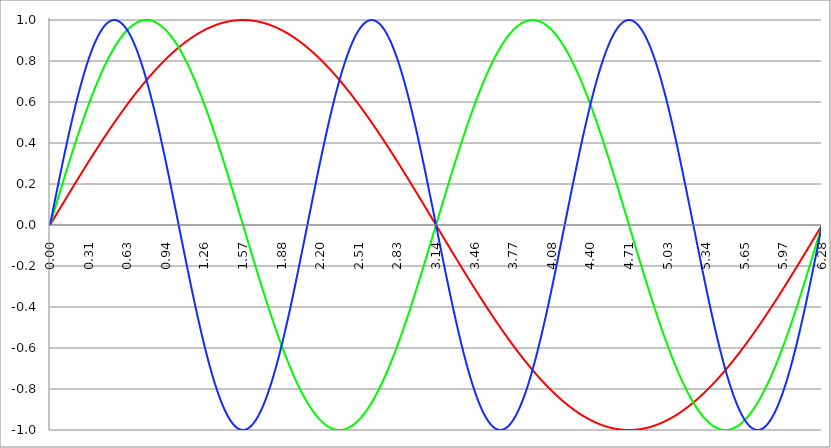
| Category | Series 1 | Series 0 | Series 2 |
|---|---|---|---|
| 0.0 | 0 | 0 | 0 |
| 0.00314159265358979 | 0.003 | 0.006 | 0.009 |
| 0.00628318530717958 | 0.006 | 0.013 | 0.019 |
| 0.00942477796076938 | 0.009 | 0.019 | 0.028 |
| 0.0125663706143592 | 0.013 | 0.025 | 0.038 |
| 0.015707963267949 | 0.016 | 0.031 | 0.047 |
| 0.0188495559215388 | 0.019 | 0.038 | 0.057 |
| 0.0219911485751285 | 0.022 | 0.044 | 0.066 |
| 0.0251327412287183 | 0.025 | 0.05 | 0.075 |
| 0.0282743338823081 | 0.028 | 0.057 | 0.085 |
| 0.0314159265358979 | 0.031 | 0.063 | 0.094 |
| 0.0345575191894877 | 0.035 | 0.069 | 0.103 |
| 0.0376991118430775 | 0.038 | 0.075 | 0.113 |
| 0.0408407044966673 | 0.041 | 0.082 | 0.122 |
| 0.0439822971502571 | 0.044 | 0.088 | 0.132 |
| 0.0471238898038469 | 0.047 | 0.094 | 0.141 |
| 0.0502654824574367 | 0.05 | 0.1 | 0.15 |
| 0.0534070751110265 | 0.053 | 0.107 | 0.16 |
| 0.0565486677646163 | 0.057 | 0.113 | 0.169 |
| 0.059690260418206 | 0.06 | 0.119 | 0.178 |
| 0.0628318530717958 | 0.063 | 0.125 | 0.187 |
| 0.0659734457253856 | 0.066 | 0.132 | 0.197 |
| 0.0691150383789754 | 0.069 | 0.138 | 0.206 |
| 0.0722566310325652 | 0.072 | 0.144 | 0.215 |
| 0.075398223686155 | 0.075 | 0.15 | 0.224 |
| 0.0785398163397448 | 0.078 | 0.156 | 0.233 |
| 0.0816814089933346 | 0.082 | 0.163 | 0.243 |
| 0.0848230016469244 | 0.085 | 0.169 | 0.252 |
| 0.0879645943005142 | 0.088 | 0.175 | 0.261 |
| 0.091106186954104 | 0.091 | 0.181 | 0.27 |
| 0.0942477796076937 | 0.094 | 0.187 | 0.279 |
| 0.0973893722612835 | 0.097 | 0.194 | 0.288 |
| 0.100530964914873 | 0.1 | 0.2 | 0.297 |
| 0.103672557568463 | 0.103 | 0.206 | 0.306 |
| 0.106814150222053 | 0.107 | 0.212 | 0.315 |
| 0.109955742875643 | 0.11 | 0.218 | 0.324 |
| 0.113097335529233 | 0.113 | 0.224 | 0.333 |
| 0.116238928182822 | 0.116 | 0.23 | 0.342 |
| 0.119380520836412 | 0.119 | 0.236 | 0.351 |
| 0.122522113490002 | 0.122 | 0.243 | 0.359 |
| 0.125663706143592 | 0.125 | 0.249 | 0.368 |
| 0.128805298797181 | 0.128 | 0.255 | 0.377 |
| 0.131946891450771 | 0.132 | 0.261 | 0.386 |
| 0.135088484104361 | 0.135 | 0.267 | 0.394 |
| 0.138230076757951 | 0.138 | 0.273 | 0.403 |
| 0.141371669411541 | 0.141 | 0.279 | 0.412 |
| 0.14451326206513 | 0.144 | 0.285 | 0.42 |
| 0.14765485471872 | 0.147 | 0.291 | 0.429 |
| 0.15079644737231 | 0.15 | 0.297 | 0.437 |
| 0.1539380400259 | 0.153 | 0.303 | 0.446 |
| 0.15707963267949 | 0.156 | 0.309 | 0.454 |
| 0.160221225333079 | 0.16 | 0.315 | 0.462 |
| 0.163362817986669 | 0.163 | 0.321 | 0.471 |
| 0.166504410640259 | 0.166 | 0.327 | 0.479 |
| 0.169646003293849 | 0.169 | 0.333 | 0.487 |
| 0.172787595947439 | 0.172 | 0.339 | 0.495 |
| 0.175929188601028 | 0.175 | 0.345 | 0.504 |
| 0.179070781254618 | 0.178 | 0.351 | 0.512 |
| 0.182212373908208 | 0.181 | 0.356 | 0.52 |
| 0.185353966561798 | 0.184 | 0.362 | 0.528 |
| 0.188495559215388 | 0.187 | 0.368 | 0.536 |
| 0.191637151868977 | 0.19 | 0.374 | 0.544 |
| 0.194778744522567 | 0.194 | 0.38 | 0.552 |
| 0.197920337176157 | 0.197 | 0.386 | 0.559 |
| 0.201061929829747 | 0.2 | 0.391 | 0.567 |
| 0.204203522483336 | 0.203 | 0.397 | 0.575 |
| 0.207345115136926 | 0.206 | 0.403 | 0.583 |
| 0.210486707790516 | 0.209 | 0.409 | 0.59 |
| 0.213628300444106 | 0.212 | 0.414 | 0.598 |
| 0.216769893097696 | 0.215 | 0.42 | 0.605 |
| 0.219911485751285 | 0.218 | 0.426 | 0.613 |
| 0.223053078404875 | 0.221 | 0.431 | 0.62 |
| 0.226194671058465 | 0.224 | 0.437 | 0.628 |
| 0.229336263712055 | 0.227 | 0.443 | 0.635 |
| 0.232477856365645 | 0.23 | 0.448 | 0.642 |
| 0.235619449019234 | 0.233 | 0.454 | 0.649 |
| 0.238761041672824 | 0.236 | 0.46 | 0.657 |
| 0.241902634326414 | 0.24 | 0.465 | 0.664 |
| 0.245044226980004 | 0.243 | 0.471 | 0.671 |
| 0.248185819633594 | 0.246 | 0.476 | 0.678 |
| 0.251327412287183 | 0.249 | 0.482 | 0.685 |
| 0.254469004940773 | 0.252 | 0.487 | 0.691 |
| 0.257610597594363 | 0.255 | 0.493 | 0.698 |
| 0.260752190247953 | 0.258 | 0.498 | 0.705 |
| 0.263893782901543 | 0.261 | 0.504 | 0.712 |
| 0.267035375555132 | 0.264 | 0.509 | 0.718 |
| 0.270176968208722 | 0.267 | 0.514 | 0.725 |
| 0.273318560862312 | 0.27 | 0.52 | 0.731 |
| 0.276460153515902 | 0.273 | 0.525 | 0.738 |
| 0.279601746169492 | 0.276 | 0.531 | 0.744 |
| 0.282743338823082 | 0.279 | 0.536 | 0.75 |
| 0.285884931476671 | 0.282 | 0.541 | 0.756 |
| 0.289026524130261 | 0.285 | 0.546 | 0.762 |
| 0.292168116783851 | 0.288 | 0.552 | 0.769 |
| 0.295309709437441 | 0.291 | 0.557 | 0.775 |
| 0.298451302091031 | 0.294 | 0.562 | 0.78 |
| 0.30159289474462 | 0.297 | 0.567 | 0.786 |
| 0.30473448739821 | 0.3 | 0.572 | 0.792 |
| 0.3078760800518 | 0.303 | 0.578 | 0.798 |
| 0.31101767270539 | 0.306 | 0.583 | 0.803 |
| 0.31415926535898 | 0.309 | 0.588 | 0.809 |
| 0.31730085801257 | 0.312 | 0.593 | 0.815 |
| 0.320442450666159 | 0.315 | 0.598 | 0.82 |
| 0.323584043319749 | 0.318 | 0.603 | 0.825 |
| 0.326725635973339 | 0.321 | 0.608 | 0.831 |
| 0.329867228626929 | 0.324 | 0.613 | 0.836 |
| 0.333008821280519 | 0.327 | 0.618 | 0.841 |
| 0.336150413934108 | 0.33 | 0.623 | 0.846 |
| 0.339292006587698 | 0.333 | 0.628 | 0.851 |
| 0.342433599241288 | 0.336 | 0.633 | 0.856 |
| 0.345575191894878 | 0.339 | 0.637 | 0.861 |
| 0.348716784548468 | 0.342 | 0.642 | 0.866 |
| 0.351858377202058 | 0.345 | 0.647 | 0.87 |
| 0.354999969855647 | 0.348 | 0.652 | 0.875 |
| 0.358141562509237 | 0.351 | 0.657 | 0.879 |
| 0.361283155162827 | 0.353 | 0.661 | 0.884 |
| 0.364424747816417 | 0.356 | 0.666 | 0.888 |
| 0.367566340470007 | 0.359 | 0.671 | 0.892 |
| 0.370707933123597 | 0.362 | 0.675 | 0.897 |
| 0.373849525777186 | 0.365 | 0.68 | 0.901 |
| 0.376991118430776 | 0.368 | 0.685 | 0.905 |
| 0.380132711084366 | 0.371 | 0.689 | 0.909 |
| 0.383274303737956 | 0.374 | 0.694 | 0.913 |
| 0.386415896391546 | 0.377 | 0.698 | 0.917 |
| 0.389557489045135 | 0.38 | 0.703 | 0.92 |
| 0.392699081698725 | 0.383 | 0.707 | 0.924 |
| 0.395840674352315 | 0.386 | 0.712 | 0.927 |
| 0.398982267005905 | 0.388 | 0.716 | 0.931 |
| 0.402123859659495 | 0.391 | 0.72 | 0.934 |
| 0.405265452313085 | 0.394 | 0.725 | 0.938 |
| 0.408407044966674 | 0.397 | 0.729 | 0.941 |
| 0.411548637620264 | 0.4 | 0.733 | 0.944 |
| 0.414690230273854 | 0.403 | 0.738 | 0.947 |
| 0.417831822927444 | 0.406 | 0.742 | 0.95 |
| 0.420973415581034 | 0.409 | 0.746 | 0.953 |
| 0.424115008234623 | 0.412 | 0.75 | 0.956 |
| 0.427256600888213 | 0.414 | 0.754 | 0.959 |
| 0.430398193541803 | 0.417 | 0.758 | 0.961 |
| 0.433539786195393 | 0.42 | 0.762 | 0.964 |
| 0.436681378848983 | 0.423 | 0.766 | 0.966 |
| 0.439822971502573 | 0.426 | 0.771 | 0.969 |
| 0.442964564156162 | 0.429 | 0.775 | 0.971 |
| 0.446106156809752 | 0.431 | 0.778 | 0.973 |
| 0.449247749463342 | 0.434 | 0.782 | 0.975 |
| 0.452389342116932 | 0.437 | 0.786 | 0.977 |
| 0.455530934770522 | 0.44 | 0.79 | 0.979 |
| 0.458672527424111 | 0.443 | 0.794 | 0.981 |
| 0.461814120077701 | 0.446 | 0.798 | 0.983 |
| 0.464955712731291 | 0.448 | 0.802 | 0.985 |
| 0.468097305384881 | 0.451 | 0.805 | 0.986 |
| 0.471238898038471 | 0.454 | 0.809 | 0.988 |
| 0.474380490692061 | 0.457 | 0.813 | 0.989 |
| 0.47752208334565 | 0.46 | 0.816 | 0.99 |
| 0.48066367599924 | 0.462 | 0.82 | 0.992 |
| 0.48380526865283 | 0.465 | 0.824 | 0.993 |
| 0.48694686130642 | 0.468 | 0.827 | 0.994 |
| 0.49008845396001 | 0.471 | 0.831 | 0.995 |
| 0.493230046613599 | 0.473 | 0.834 | 0.996 |
| 0.496371639267189 | 0.476 | 0.838 | 0.997 |
| 0.499513231920779 | 0.479 | 0.841 | 0.997 |
| 0.502654824574369 | 0.482 | 0.844 | 0.998 |
| 0.505796417227959 | 0.485 | 0.848 | 0.999 |
| 0.508938009881549 | 0.487 | 0.851 | 0.999 |
| 0.512079602535138 | 0.49 | 0.854 | 0.999 |
| 0.515221195188728 | 0.493 | 0.858 | 1 |
| 0.518362787842318 | 0.495 | 0.861 | 1 |
| 0.521504380495908 | 0.498 | 0.864 | 1 |
| 0.524645973149498 | 0.501 | 0.867 | 1 |
| 0.527787565803087 | 0.504 | 0.87 | 1 |
| 0.530929158456677 | 0.506 | 0.873 | 1 |
| 0.534070751110267 | 0.509 | 0.876 | 1 |
| 0.537212343763857 | 0.512 | 0.879 | 0.999 |
| 0.540353936417447 | 0.514 | 0.882 | 0.999 |
| 0.543495529071037 | 0.517 | 0.885 | 0.998 |
| 0.546637121724626 | 0.52 | 0.888 | 0.998 |
| 0.549778714378216 | 0.522 | 0.891 | 0.997 |
| 0.552920307031806 | 0.525 | 0.894 | 0.996 |
| 0.556061899685396 | 0.528 | 0.897 | 0.995 |
| 0.559203492338986 | 0.531 | 0.899 | 0.994 |
| 0.562345084992576 | 0.533 | 0.902 | 0.993 |
| 0.565486677646165 | 0.536 | 0.905 | 0.992 |
| 0.568628270299755 | 0.538 | 0.907 | 0.991 |
| 0.571769862953345 | 0.541 | 0.91 | 0.99 |
| 0.574911455606935 | 0.544 | 0.913 | 0.988 |
| 0.578053048260525 | 0.546 | 0.915 | 0.987 |
| 0.581194640914114 | 0.549 | 0.918 | 0.985 |
| 0.584336233567704 | 0.552 | 0.92 | 0.983 |
| 0.587477826221294 | 0.554 | 0.923 | 0.982 |
| 0.590619418874884 | 0.557 | 0.925 | 0.98 |
| 0.593761011528474 | 0.559 | 0.927 | 0.978 |
| 0.596902604182064 | 0.562 | 0.93 | 0.976 |
| 0.600044196835653 | 0.565 | 0.932 | 0.974 |
| 0.603185789489243 | 0.567 | 0.934 | 0.972 |
| 0.606327382142833 | 0.57 | 0.937 | 0.969 |
| 0.609468974796423 | 0.572 | 0.939 | 0.967 |
| 0.612610567450013 | 0.575 | 0.941 | 0.965 |
| 0.615752160103602 | 0.578 | 0.943 | 0.962 |
| 0.618893752757192 | 0.58 | 0.945 | 0.959 |
| 0.622035345410782 | 0.583 | 0.947 | 0.957 |
| 0.625176938064372 | 0.585 | 0.949 | 0.954 |
| 0.628318530717962 | 0.588 | 0.951 | 0.951 |
| 0.631460123371551 | 0.59 | 0.953 | 0.948 |
| 0.634601716025141 | 0.593 | 0.955 | 0.945 |
| 0.637743308678731 | 0.595 | 0.957 | 0.942 |
| 0.640884901332321 | 0.598 | 0.959 | 0.939 |
| 0.644026493985911 | 0.6 | 0.96 | 0.935 |
| 0.647168086639501 | 0.603 | 0.962 | 0.932 |
| 0.65030967929309 | 0.605 | 0.964 | 0.929 |
| 0.65345127194668 | 0.608 | 0.965 | 0.925 |
| 0.65659286460027 | 0.61 | 0.967 | 0.921 |
| 0.65973445725386 | 0.613 | 0.969 | 0.918 |
| 0.66287604990745 | 0.615 | 0.97 | 0.914 |
| 0.666017642561039 | 0.618 | 0.972 | 0.91 |
| 0.669159235214629 | 0.62 | 0.973 | 0.906 |
| 0.672300827868219 | 0.623 | 0.975 | 0.902 |
| 0.675442420521809 | 0.625 | 0.976 | 0.898 |
| 0.678584013175399 | 0.628 | 0.977 | 0.894 |
| 0.681725605828989 | 0.63 | 0.979 | 0.89 |
| 0.684867198482578 | 0.633 | 0.98 | 0.885 |
| 0.688008791136168 | 0.635 | 0.981 | 0.881 |
| 0.691150383789758 | 0.637 | 0.982 | 0.876 |
| 0.694291976443348 | 0.64 | 0.983 | 0.872 |
| 0.697433569096938 | 0.642 | 0.985 | 0.867 |
| 0.700575161750528 | 0.645 | 0.986 | 0.862 |
| 0.703716754404117 | 0.647 | 0.987 | 0.858 |
| 0.706858347057707 | 0.649 | 0.988 | 0.853 |
| 0.709999939711297 | 0.652 | 0.989 | 0.848 |
| 0.713141532364887 | 0.654 | 0.99 | 0.843 |
| 0.716283125018477 | 0.657 | 0.99 | 0.838 |
| 0.719424717672066 | 0.659 | 0.991 | 0.832 |
| 0.722566310325656 | 0.661 | 0.992 | 0.827 |
| 0.725707902979246 | 0.664 | 0.993 | 0.822 |
| 0.728849495632836 | 0.666 | 0.994 | 0.816 |
| 0.731991088286426 | 0.668 | 0.994 | 0.811 |
| 0.735132680940016 | 0.671 | 0.995 | 0.805 |
| 0.738274273593605 | 0.673 | 0.996 | 0.8 |
| 0.741415866247195 | 0.675 | 0.996 | 0.794 |
| 0.744557458900785 | 0.678 | 0.997 | 0.788 |
| 0.747699051554375 | 0.68 | 0.997 | 0.782 |
| 0.750840644207965 | 0.682 | 0.998 | 0.776 |
| 0.753982236861554 | 0.685 | 0.998 | 0.771 |
| 0.757123829515144 | 0.687 | 0.998 | 0.764 |
| 0.760265422168734 | 0.689 | 0.999 | 0.758 |
| 0.763407014822324 | 0.691 | 0.999 | 0.752 |
| 0.766548607475914 | 0.694 | 0.999 | 0.746 |
| 0.769690200129504 | 0.696 | 1 | 0.74 |
| 0.772831792783093 | 0.698 | 1 | 0.733 |
| 0.775973385436683 | 0.7 | 1 | 0.727 |
| 0.779114978090273 | 0.703 | 1 | 0.72 |
| 0.782256570743863 | 0.705 | 1 | 0.714 |
| 0.785398163397453 | 0.707 | 1 | 0.707 |
| 0.788539756051042 | 0.709 | 1 | 0.7 |
| 0.791681348704632 | 0.712 | 1 | 0.694 |
| 0.794822941358222 | 0.714 | 1 | 0.687 |
| 0.797964534011812 | 0.716 | 1 | 0.68 |
| 0.801106126665402 | 0.718 | 1 | 0.673 |
| 0.804247719318992 | 0.72 | 0.999 | 0.666 |
| 0.807389311972581 | 0.722 | 0.999 | 0.659 |
| 0.810530904626171 | 0.725 | 0.999 | 0.652 |
| 0.813672497279761 | 0.727 | 0.998 | 0.645 |
| 0.816814089933351 | 0.729 | 0.998 | 0.637 |
| 0.819955682586941 | 0.731 | 0.998 | 0.63 |
| 0.823097275240531 | 0.733 | 0.997 | 0.623 |
| 0.82623886789412 | 0.735 | 0.997 | 0.615 |
| 0.82938046054771 | 0.738 | 0.996 | 0.608 |
| 0.8325220532013 | 0.74 | 0.996 | 0.6 |
| 0.83566364585489 | 0.742 | 0.995 | 0.593 |
| 0.83880523850848 | 0.744 | 0.994 | 0.585 |
| 0.841946831162069 | 0.746 | 0.994 | 0.578 |
| 0.845088423815659 | 0.748 | 0.993 | 0.57 |
| 0.848230016469249 | 0.75 | 0.992 | 0.562 |
| 0.851371609122839 | 0.752 | 0.991 | 0.554 |
| 0.854513201776429 | 0.754 | 0.99 | 0.546 |
| 0.857654794430019 | 0.756 | 0.99 | 0.538 |
| 0.860796387083608 | 0.758 | 0.989 | 0.531 |
| 0.863937979737198 | 0.76 | 0.988 | 0.522 |
| 0.867079572390788 | 0.762 | 0.987 | 0.514 |
| 0.870221165044378 | 0.764 | 0.986 | 0.506 |
| 0.873362757697968 | 0.766 | 0.985 | 0.498 |
| 0.876504350351557 | 0.769 | 0.983 | 0.49 |
| 0.879645943005147 | 0.771 | 0.982 | 0.482 |
| 0.882787535658737 | 0.773 | 0.981 | 0.473 |
| 0.885929128312327 | 0.775 | 0.98 | 0.465 |
| 0.889070720965917 | 0.776 | 0.979 | 0.457 |
| 0.892212313619507 | 0.778 | 0.977 | 0.448 |
| 0.895353906273096 | 0.78 | 0.976 | 0.44 |
| 0.898495498926686 | 0.782 | 0.975 | 0.431 |
| 0.901637091580276 | 0.784 | 0.973 | 0.423 |
| 0.904778684233866 | 0.786 | 0.972 | 0.414 |
| 0.907920276887456 | 0.788 | 0.97 | 0.406 |
| 0.911061869541045 | 0.79 | 0.969 | 0.397 |
| 0.914203462194635 | 0.792 | 0.967 | 0.388 |
| 0.917345054848225 | 0.794 | 0.965 | 0.38 |
| 0.920486647501815 | 0.796 | 0.964 | 0.371 |
| 0.923628240155405 | 0.798 | 0.962 | 0.362 |
| 0.926769832808995 | 0.8 | 0.96 | 0.353 |
| 0.929911425462584 | 0.802 | 0.959 | 0.345 |
| 0.933053018116174 | 0.803 | 0.957 | 0.336 |
| 0.936194610769764 | 0.805 | 0.955 | 0.327 |
| 0.939336203423354 | 0.807 | 0.953 | 0.318 |
| 0.942477796076944 | 0.809 | 0.951 | 0.309 |
| 0.945619388730533 | 0.811 | 0.949 | 0.3 |
| 0.948760981384123 | 0.813 | 0.947 | 0.291 |
| 0.951902574037713 | 0.815 | 0.945 | 0.282 |
| 0.955044166691303 | 0.816 | 0.943 | 0.273 |
| 0.958185759344893 | 0.818 | 0.941 | 0.264 |
| 0.961327351998483 | 0.82 | 0.939 | 0.255 |
| 0.964468944652072 | 0.822 | 0.937 | 0.246 |
| 0.967610537305662 | 0.824 | 0.934 | 0.236 |
| 0.970752129959252 | 0.825 | 0.932 | 0.227 |
| 0.973893722612842 | 0.827 | 0.93 | 0.218 |
| 0.977035315266432 | 0.829 | 0.927 | 0.209 |
| 0.980176907920022 | 0.831 | 0.925 | 0.2 |
| 0.983318500573611 | 0.832 | 0.923 | 0.19 |
| 0.986460093227201 | 0.834 | 0.92 | 0.181 |
| 0.989601685880791 | 0.836 | 0.918 | 0.172 |
| 0.992743278534381 | 0.838 | 0.915 | 0.163 |
| 0.995884871187971 | 0.839 | 0.913 | 0.153 |
| 0.99902646384156 | 0.841 | 0.91 | 0.144 |
| 1.00216805649515 | 0.843 | 0.907 | 0.135 |
| 1.00530964914874 | 0.844 | 0.905 | 0.125 |
| 1.00845124180233 | 0.846 | 0.902 | 0.116 |
| 1.01159283445592 | 0.848 | 0.899 | 0.107 |
| 1.01473442710951 | 0.849 | 0.897 | 0.097 |
| 1.017876019763099 | 0.851 | 0.894 | 0.088 |
| 1.021017612416689 | 0.853 | 0.891 | 0.078 |
| 1.02415920507028 | 0.854 | 0.888 | 0.069 |
| 1.027300797723869 | 0.856 | 0.885 | 0.06 |
| 1.030442390377459 | 0.858 | 0.882 | 0.05 |
| 1.033583983031048 | 0.859 | 0.879 | 0.041 |
| 1.036725575684638 | 0.861 | 0.876 | 0.031 |
| 1.039867168338228 | 0.862 | 0.873 | 0.022 |
| 1.043008760991818 | 0.864 | 0.87 | 0.013 |
| 1.046150353645408 | 0.866 | 0.867 | 0.003 |
| 1.049291946298998 | 0.867 | 0.864 | -0.006 |
| 1.052433538952587 | 0.869 | 0.861 | -0.016 |
| 1.055575131606177 | 0.87 | 0.858 | -0.025 |
| 1.058716724259767 | 0.872 | 0.854 | -0.035 |
| 1.061858316913357 | 0.873 | 0.851 | -0.044 |
| 1.064999909566947 | 0.875 | 0.848 | -0.053 |
| 1.068141502220536 | 0.876 | 0.844 | -0.063 |
| 1.071283094874126 | 0.878 | 0.841 | -0.072 |
| 1.074424687527716 | 0.879 | 0.838 | -0.082 |
| 1.077566280181306 | 0.881 | 0.834 | -0.091 |
| 1.080707872834896 | 0.882 | 0.831 | -0.1 |
| 1.083849465488486 | 0.884 | 0.827 | -0.11 |
| 1.086991058142075 | 0.885 | 0.824 | -0.119 |
| 1.090132650795665 | 0.887 | 0.82 | -0.128 |
| 1.093274243449255 | 0.888 | 0.816 | -0.138 |
| 1.096415836102845 | 0.89 | 0.813 | -0.147 |
| 1.099557428756435 | 0.891 | 0.809 | -0.156 |
| 1.102699021410025 | 0.892 | 0.805 | -0.166 |
| 1.105840614063614 | 0.894 | 0.802 | -0.175 |
| 1.108982206717204 | 0.895 | 0.798 | -0.184 |
| 1.112123799370794 | 0.897 | 0.794 | -0.194 |
| 1.115265392024384 | 0.898 | 0.79 | -0.203 |
| 1.118406984677974 | 0.899 | 0.786 | -0.212 |
| 1.121548577331563 | 0.901 | 0.782 | -0.221 |
| 1.124690169985153 | 0.902 | 0.778 | -0.23 |
| 1.127831762638743 | 0.903 | 0.775 | -0.24 |
| 1.130973355292333 | 0.905 | 0.771 | -0.249 |
| 1.134114947945923 | 0.906 | 0.766 | -0.258 |
| 1.137256540599513 | 0.907 | 0.762 | -0.267 |
| 1.140398133253102 | 0.909 | 0.758 | -0.276 |
| 1.143539725906692 | 0.91 | 0.754 | -0.285 |
| 1.146681318560282 | 0.911 | 0.75 | -0.294 |
| 1.149822911213872 | 0.913 | 0.746 | -0.303 |
| 1.152964503867462 | 0.914 | 0.742 | -0.312 |
| 1.156106096521051 | 0.915 | 0.738 | -0.321 |
| 1.159247689174641 | 0.917 | 0.733 | -0.33 |
| 1.162389281828231 | 0.918 | 0.729 | -0.339 |
| 1.165530874481821 | 0.919 | 0.725 | -0.348 |
| 1.168672467135411 | 0.92 | 0.72 | -0.356 |
| 1.171814059789001 | 0.921 | 0.716 | -0.365 |
| 1.17495565244259 | 0.923 | 0.712 | -0.374 |
| 1.17809724509618 | 0.924 | 0.707 | -0.383 |
| 1.18123883774977 | 0.925 | 0.703 | -0.391 |
| 1.18438043040336 | 0.926 | 0.698 | -0.4 |
| 1.18752202305695 | 0.927 | 0.694 | -0.409 |
| 1.190663615710539 | 0.929 | 0.689 | -0.417 |
| 1.193805208364129 | 0.93 | 0.685 | -0.426 |
| 1.19694680101772 | 0.931 | 0.68 | -0.434 |
| 1.200088393671309 | 0.932 | 0.675 | -0.443 |
| 1.203229986324899 | 0.933 | 0.671 | -0.451 |
| 1.206371578978489 | 0.934 | 0.666 | -0.46 |
| 1.209513171632078 | 0.935 | 0.661 | -0.468 |
| 1.212654764285668 | 0.937 | 0.657 | -0.476 |
| 1.215796356939258 | 0.938 | 0.652 | -0.485 |
| 1.218937949592848 | 0.939 | 0.647 | -0.493 |
| 1.222079542246438 | 0.94 | 0.642 | -0.501 |
| 1.225221134900027 | 0.941 | 0.637 | -0.509 |
| 1.228362727553617 | 0.942 | 0.633 | -0.517 |
| 1.231504320207207 | 0.943 | 0.628 | -0.525 |
| 1.234645912860797 | 0.944 | 0.623 | -0.533 |
| 1.237787505514387 | 0.945 | 0.618 | -0.541 |
| 1.240929098167977 | 0.946 | 0.613 | -0.549 |
| 1.244070690821566 | 0.947 | 0.608 | -0.557 |
| 1.247212283475156 | 0.948 | 0.603 | -0.565 |
| 1.250353876128746 | 0.949 | 0.598 | -0.572 |
| 1.253495468782336 | 0.95 | 0.593 | -0.58 |
| 1.256637061435926 | 0.951 | 0.588 | -0.588 |
| 1.259778654089515 | 0.952 | 0.583 | -0.595 |
| 1.262920246743105 | 0.953 | 0.578 | -0.603 |
| 1.266061839396695 | 0.954 | 0.572 | -0.61 |
| 1.269203432050285 | 0.955 | 0.567 | -0.618 |
| 1.272345024703875 | 0.956 | 0.562 | -0.625 |
| 1.275486617357465 | 0.957 | 0.557 | -0.633 |
| 1.278628210011054 | 0.958 | 0.552 | -0.64 |
| 1.281769802664644 | 0.959 | 0.546 | -0.647 |
| 1.284911395318234 | 0.959 | 0.541 | -0.654 |
| 1.288052987971824 | 0.96 | 0.536 | -0.661 |
| 1.291194580625414 | 0.961 | 0.531 | -0.668 |
| 1.294336173279003 | 0.962 | 0.525 | -0.675 |
| 1.297477765932593 | 0.963 | 0.52 | -0.682 |
| 1.300619358586183 | 0.964 | 0.514 | -0.689 |
| 1.303760951239773 | 0.965 | 0.509 | -0.696 |
| 1.306902543893363 | 0.965 | 0.504 | -0.703 |
| 1.310044136546953 | 0.966 | 0.498 | -0.709 |
| 1.313185729200542 | 0.967 | 0.493 | -0.716 |
| 1.316327321854132 | 0.968 | 0.487 | -0.722 |
| 1.319468914507722 | 0.969 | 0.482 | -0.729 |
| 1.322610507161312 | 0.969 | 0.476 | -0.735 |
| 1.325752099814902 | 0.97 | 0.471 | -0.742 |
| 1.328893692468491 | 0.971 | 0.465 | -0.748 |
| 1.332035285122081 | 0.972 | 0.46 | -0.754 |
| 1.335176877775671 | 0.972 | 0.454 | -0.76 |
| 1.338318470429261 | 0.973 | 0.448 | -0.766 |
| 1.341460063082851 | 0.974 | 0.443 | -0.773 |
| 1.344601655736441 | 0.975 | 0.437 | -0.778 |
| 1.34774324839003 | 0.975 | 0.431 | -0.784 |
| 1.35088484104362 | 0.976 | 0.426 | -0.79 |
| 1.35402643369721 | 0.977 | 0.42 | -0.796 |
| 1.3571680263508 | 0.977 | 0.414 | -0.802 |
| 1.36030961900439 | 0.978 | 0.409 | -0.807 |
| 1.363451211657979 | 0.979 | 0.403 | -0.813 |
| 1.36659280431157 | 0.979 | 0.397 | -0.818 |
| 1.369734396965159 | 0.98 | 0.391 | -0.824 |
| 1.372875989618749 | 0.98 | 0.386 | -0.829 |
| 1.376017582272339 | 0.981 | 0.38 | -0.834 |
| 1.379159174925929 | 0.982 | 0.374 | -0.839 |
| 1.382300767579518 | 0.982 | 0.368 | -0.844 |
| 1.385442360233108 | 0.983 | 0.362 | -0.849 |
| 1.388583952886698 | 0.983 | 0.356 | -0.854 |
| 1.391725545540288 | 0.984 | 0.351 | -0.859 |
| 1.394867138193878 | 0.985 | 0.345 | -0.864 |
| 1.398008730847468 | 0.985 | 0.339 | -0.869 |
| 1.401150323501057 | 0.986 | 0.333 | -0.873 |
| 1.404291916154647 | 0.986 | 0.327 | -0.878 |
| 1.407433508808237 | 0.987 | 0.321 | -0.882 |
| 1.410575101461827 | 0.987 | 0.315 | -0.887 |
| 1.413716694115417 | 0.988 | 0.309 | -0.891 |
| 1.416858286769006 | 0.988 | 0.303 | -0.895 |
| 1.419999879422596 | 0.989 | 0.297 | -0.899 |
| 1.423141472076186 | 0.989 | 0.291 | -0.903 |
| 1.426283064729776 | 0.99 | 0.285 | -0.907 |
| 1.429424657383366 | 0.99 | 0.279 | -0.911 |
| 1.432566250036956 | 0.99 | 0.273 | -0.915 |
| 1.435707842690545 | 0.991 | 0.267 | -0.919 |
| 1.438849435344135 | 0.991 | 0.261 | -0.923 |
| 1.441991027997725 | 0.992 | 0.255 | -0.926 |
| 1.445132620651315 | 0.992 | 0.249 | -0.93 |
| 1.448274213304905 | 0.993 | 0.243 | -0.933 |
| 1.451415805958494 | 0.993 | 0.236 | -0.937 |
| 1.454557398612084 | 0.993 | 0.23 | -0.94 |
| 1.457698991265674 | 0.994 | 0.224 | -0.943 |
| 1.460840583919264 | 0.994 | 0.218 | -0.946 |
| 1.463982176572854 | 0.994 | 0.212 | -0.949 |
| 1.467123769226444 | 0.995 | 0.206 | -0.952 |
| 1.470265361880033 | 0.995 | 0.2 | -0.955 |
| 1.473406954533623 | 0.995 | 0.194 | -0.958 |
| 1.476548547187213 | 0.996 | 0.187 | -0.96 |
| 1.479690139840803 | 0.996 | 0.181 | -0.963 |
| 1.482831732494393 | 0.996 | 0.175 | -0.965 |
| 1.485973325147982 | 0.996 | 0.169 | -0.968 |
| 1.489114917801572 | 0.997 | 0.163 | -0.97 |
| 1.492256510455162 | 0.997 | 0.156 | -0.972 |
| 1.495398103108752 | 0.997 | 0.15 | -0.975 |
| 1.498539695762342 | 0.997 | 0.144 | -0.977 |
| 1.501681288415932 | 0.998 | 0.138 | -0.979 |
| 1.504822881069521 | 0.998 | 0.132 | -0.98 |
| 1.507964473723111 | 0.998 | 0.125 | -0.982 |
| 1.511106066376701 | 0.998 | 0.119 | -0.984 |
| 1.514247659030291 | 0.998 | 0.113 | -0.986 |
| 1.517389251683881 | 0.999 | 0.107 | -0.987 |
| 1.520530844337471 | 0.999 | 0.1 | -0.989 |
| 1.52367243699106 | 0.999 | 0.094 | -0.99 |
| 1.52681402964465 | 0.999 | 0.088 | -0.991 |
| 1.52995562229824 | 0.999 | 0.082 | -0.993 |
| 1.53309721495183 | 0.999 | 0.075 | -0.994 |
| 1.53623880760542 | 0.999 | 0.069 | -0.995 |
| 1.539380400259009 | 1 | 0.063 | -0.996 |
| 1.542521992912599 | 1 | 0.057 | -0.996 |
| 1.545663585566189 | 1 | 0.05 | -0.997 |
| 1.548805178219779 | 1 | 0.044 | -0.998 |
| 1.551946770873369 | 1 | 0.038 | -0.998 |
| 1.555088363526959 | 1 | 0.031 | -0.999 |
| 1.558229956180548 | 1 | 0.025 | -0.999 |
| 1.561371548834138 | 1 | 0.019 | -1 |
| 1.564513141487728 | 1 | 0.013 | -1 |
| 1.567654734141318 | 1 | 0.006 | -1 |
| 1.570796326794908 | 1 | 0 | -1 |
| 1.573937919448497 | 1 | -0.006 | -1 |
| 1.577079512102087 | 1 | -0.013 | -1 |
| 1.580221104755677 | 1 | -0.019 | -1 |
| 1.583362697409267 | 1 | -0.025 | -0.999 |
| 1.586504290062857 | 1 | -0.031 | -0.999 |
| 1.589645882716447 | 1 | -0.038 | -0.998 |
| 1.592787475370036 | 1 | -0.044 | -0.998 |
| 1.595929068023626 | 1 | -0.05 | -0.997 |
| 1.599070660677216 | 1 | -0.057 | -0.996 |
| 1.602212253330806 | 1 | -0.063 | -0.996 |
| 1.605353845984396 | 0.999 | -0.069 | -0.995 |
| 1.608495438637985 | 0.999 | -0.075 | -0.994 |
| 1.611637031291575 | 0.999 | -0.082 | -0.993 |
| 1.614778623945165 | 0.999 | -0.088 | -0.991 |
| 1.617920216598755 | 0.999 | -0.094 | -0.99 |
| 1.621061809252345 | 0.999 | -0.1 | -0.989 |
| 1.624203401905935 | 0.999 | -0.107 | -0.987 |
| 1.627344994559524 | 0.998 | -0.113 | -0.986 |
| 1.630486587213114 | 0.998 | -0.119 | -0.984 |
| 1.633628179866704 | 0.998 | -0.125 | -0.982 |
| 1.636769772520294 | 0.998 | -0.132 | -0.98 |
| 1.639911365173884 | 0.998 | -0.138 | -0.979 |
| 1.643052957827473 | 0.997 | -0.144 | -0.977 |
| 1.646194550481063 | 0.997 | -0.15 | -0.975 |
| 1.649336143134653 | 0.997 | -0.156 | -0.972 |
| 1.652477735788243 | 0.997 | -0.163 | -0.97 |
| 1.655619328441833 | 0.996 | -0.169 | -0.968 |
| 1.658760921095423 | 0.996 | -0.175 | -0.965 |
| 1.661902513749012 | 0.996 | -0.181 | -0.963 |
| 1.665044106402602 | 0.996 | -0.187 | -0.96 |
| 1.668185699056192 | 0.995 | -0.194 | -0.958 |
| 1.671327291709782 | 0.995 | -0.2 | -0.955 |
| 1.674468884363372 | 0.995 | -0.206 | -0.952 |
| 1.677610477016961 | 0.994 | -0.212 | -0.949 |
| 1.680752069670551 | 0.994 | -0.218 | -0.946 |
| 1.683893662324141 | 0.994 | -0.224 | -0.943 |
| 1.687035254977731 | 0.993 | -0.23 | -0.94 |
| 1.690176847631321 | 0.993 | -0.236 | -0.937 |
| 1.693318440284911 | 0.993 | -0.243 | -0.933 |
| 1.6964600329385 | 0.992 | -0.249 | -0.93 |
| 1.69960162559209 | 0.992 | -0.255 | -0.926 |
| 1.70274321824568 | 0.991 | -0.261 | -0.923 |
| 1.70588481089927 | 0.991 | -0.267 | -0.919 |
| 1.70902640355286 | 0.99 | -0.273 | -0.915 |
| 1.712167996206449 | 0.99 | -0.279 | -0.911 |
| 1.715309588860039 | 0.99 | -0.285 | -0.907 |
| 1.71845118151363 | 0.989 | -0.291 | -0.903 |
| 1.721592774167219 | 0.989 | -0.297 | -0.899 |
| 1.724734366820809 | 0.988 | -0.303 | -0.895 |
| 1.727875959474399 | 0.988 | -0.309 | -0.891 |
| 1.731017552127988 | 0.987 | -0.315 | -0.887 |
| 1.734159144781578 | 0.987 | -0.321 | -0.882 |
| 1.737300737435168 | 0.986 | -0.327 | -0.878 |
| 1.740442330088758 | 0.986 | -0.333 | -0.873 |
| 1.743583922742348 | 0.985 | -0.339 | -0.869 |
| 1.746725515395937 | 0.985 | -0.345 | -0.864 |
| 1.749867108049527 | 0.984 | -0.351 | -0.859 |
| 1.753008700703117 | 0.983 | -0.356 | -0.854 |
| 1.756150293356707 | 0.983 | -0.362 | -0.849 |
| 1.759291886010297 | 0.982 | -0.368 | -0.844 |
| 1.762433478663887 | 0.982 | -0.374 | -0.839 |
| 1.765575071317476 | 0.981 | -0.38 | -0.834 |
| 1.768716663971066 | 0.98 | -0.386 | -0.829 |
| 1.771858256624656 | 0.98 | -0.391 | -0.824 |
| 1.774999849278246 | 0.979 | -0.397 | -0.818 |
| 1.778141441931836 | 0.979 | -0.403 | -0.813 |
| 1.781283034585426 | 0.978 | -0.409 | -0.807 |
| 1.784424627239015 | 0.977 | -0.414 | -0.802 |
| 1.787566219892605 | 0.977 | -0.42 | -0.796 |
| 1.790707812546195 | 0.976 | -0.426 | -0.79 |
| 1.793849405199785 | 0.975 | -0.431 | -0.784 |
| 1.796990997853375 | 0.975 | -0.437 | -0.778 |
| 1.800132590506964 | 0.974 | -0.443 | -0.773 |
| 1.803274183160554 | 0.973 | -0.448 | -0.766 |
| 1.806415775814144 | 0.972 | -0.454 | -0.76 |
| 1.809557368467734 | 0.972 | -0.46 | -0.754 |
| 1.812698961121324 | 0.971 | -0.465 | -0.748 |
| 1.815840553774914 | 0.97 | -0.471 | -0.742 |
| 1.818982146428503 | 0.969 | -0.476 | -0.735 |
| 1.822123739082093 | 0.969 | -0.482 | -0.729 |
| 1.825265331735683 | 0.968 | -0.487 | -0.722 |
| 1.828406924389273 | 0.967 | -0.493 | -0.716 |
| 1.831548517042863 | 0.966 | -0.498 | -0.709 |
| 1.834690109696452 | 0.965 | -0.504 | -0.703 |
| 1.837831702350042 | 0.965 | -0.509 | -0.696 |
| 1.840973295003632 | 0.964 | -0.514 | -0.689 |
| 1.844114887657222 | 0.963 | -0.52 | -0.682 |
| 1.847256480310812 | 0.962 | -0.525 | -0.675 |
| 1.850398072964402 | 0.961 | -0.531 | -0.668 |
| 1.853539665617991 | 0.96 | -0.536 | -0.661 |
| 1.856681258271581 | 0.959 | -0.541 | -0.654 |
| 1.859822850925171 | 0.959 | -0.546 | -0.647 |
| 1.862964443578761 | 0.958 | -0.552 | -0.64 |
| 1.866106036232351 | 0.957 | -0.557 | -0.633 |
| 1.86924762888594 | 0.956 | -0.562 | -0.625 |
| 1.87238922153953 | 0.955 | -0.567 | -0.618 |
| 1.87553081419312 | 0.954 | -0.572 | -0.61 |
| 1.87867240684671 | 0.953 | -0.578 | -0.603 |
| 1.8818139995003 | 0.952 | -0.583 | -0.595 |
| 1.88495559215389 | 0.951 | -0.588 | -0.588 |
| 1.888097184807479 | 0.95 | -0.593 | -0.58 |
| 1.891238777461069 | 0.949 | -0.598 | -0.572 |
| 1.89438037011466 | 0.948 | -0.603 | -0.565 |
| 1.897521962768249 | 0.947 | -0.608 | -0.557 |
| 1.900663555421839 | 0.946 | -0.613 | -0.549 |
| 1.903805148075429 | 0.945 | -0.618 | -0.541 |
| 1.906946740729018 | 0.944 | -0.623 | -0.533 |
| 1.910088333382608 | 0.943 | -0.628 | -0.525 |
| 1.913229926036198 | 0.942 | -0.633 | -0.517 |
| 1.916371518689788 | 0.941 | -0.637 | -0.509 |
| 1.919513111343378 | 0.94 | -0.642 | -0.501 |
| 1.922654703996967 | 0.939 | -0.647 | -0.493 |
| 1.925796296650557 | 0.938 | -0.652 | -0.485 |
| 1.928937889304147 | 0.937 | -0.657 | -0.476 |
| 1.932079481957737 | 0.935 | -0.661 | -0.468 |
| 1.935221074611327 | 0.934 | -0.666 | -0.46 |
| 1.938362667264917 | 0.933 | -0.671 | -0.451 |
| 1.941504259918506 | 0.932 | -0.675 | -0.443 |
| 1.944645852572096 | 0.931 | -0.68 | -0.434 |
| 1.947787445225686 | 0.93 | -0.685 | -0.426 |
| 1.950929037879276 | 0.929 | -0.689 | -0.417 |
| 1.954070630532866 | 0.927 | -0.694 | -0.409 |
| 1.957212223186455 | 0.926 | -0.698 | -0.4 |
| 1.960353815840045 | 0.925 | -0.703 | -0.391 |
| 1.963495408493635 | 0.924 | -0.707 | -0.383 |
| 1.966637001147225 | 0.923 | -0.712 | -0.374 |
| 1.969778593800815 | 0.921 | -0.716 | -0.365 |
| 1.972920186454405 | 0.92 | -0.72 | -0.356 |
| 1.976061779107994 | 0.919 | -0.725 | -0.348 |
| 1.979203371761584 | 0.918 | -0.729 | -0.339 |
| 1.982344964415174 | 0.917 | -0.733 | -0.33 |
| 1.985486557068764 | 0.915 | -0.738 | -0.321 |
| 1.988628149722354 | 0.914 | -0.742 | -0.312 |
| 1.991769742375943 | 0.913 | -0.746 | -0.303 |
| 1.994911335029533 | 0.911 | -0.75 | -0.294 |
| 1.998052927683123 | 0.91 | -0.754 | -0.285 |
| 2.001194520336712 | 0.909 | -0.758 | -0.276 |
| 2.004336112990302 | 0.907 | -0.762 | -0.267 |
| 2.007477705643892 | 0.906 | -0.766 | -0.258 |
| 2.010619298297482 | 0.905 | -0.771 | -0.249 |
| 2.013760890951071 | 0.903 | -0.775 | -0.24 |
| 2.016902483604661 | 0.902 | -0.778 | -0.23 |
| 2.02004407625825 | 0.901 | -0.782 | -0.221 |
| 2.02318566891184 | 0.899 | -0.786 | -0.212 |
| 2.02632726156543 | 0.898 | -0.79 | -0.203 |
| 2.029468854219019 | 0.897 | -0.794 | -0.194 |
| 2.032610446872609 | 0.895 | -0.798 | -0.184 |
| 2.035752039526198 | 0.894 | -0.802 | -0.175 |
| 2.038893632179788 | 0.892 | -0.805 | -0.166 |
| 2.042035224833378 | 0.891 | -0.809 | -0.156 |
| 2.045176817486967 | 0.89 | -0.813 | -0.147 |
| 2.048318410140557 | 0.888 | -0.816 | -0.138 |
| 2.051460002794146 | 0.887 | -0.82 | -0.128 |
| 2.054601595447736 | 0.885 | -0.824 | -0.119 |
| 2.057743188101325 | 0.884 | -0.827 | -0.11 |
| 2.060884780754915 | 0.882 | -0.831 | -0.1 |
| 2.064026373408505 | 0.881 | -0.834 | -0.091 |
| 2.067167966062094 | 0.879 | -0.838 | -0.082 |
| 2.070309558715684 | 0.878 | -0.841 | -0.072 |
| 2.073451151369273 | 0.876 | -0.844 | -0.063 |
| 2.076592744022863 | 0.875 | -0.848 | -0.053 |
| 2.079734336676452 | 0.873 | -0.851 | -0.044 |
| 2.082875929330042 | 0.872 | -0.854 | -0.035 |
| 2.086017521983632 | 0.87 | -0.858 | -0.025 |
| 2.089159114637221 | 0.869 | -0.861 | -0.016 |
| 2.092300707290811 | 0.867 | -0.864 | -0.006 |
| 2.095442299944401 | 0.866 | -0.867 | 0.003 |
| 2.09858389259799 | 0.864 | -0.87 | 0.013 |
| 2.10172548525158 | 0.862 | -0.873 | 0.022 |
| 2.104867077905169 | 0.861 | -0.876 | 0.031 |
| 2.108008670558759 | 0.859 | -0.879 | 0.041 |
| 2.111150263212349 | 0.858 | -0.882 | 0.05 |
| 2.114291855865938 | 0.856 | -0.885 | 0.06 |
| 2.117433448519528 | 0.854 | -0.888 | 0.069 |
| 2.120575041173117 | 0.853 | -0.891 | 0.078 |
| 2.123716633826707 | 0.851 | -0.894 | 0.088 |
| 2.126858226480297 | 0.849 | -0.897 | 0.097 |
| 2.129999819133886 | 0.848 | -0.899 | 0.107 |
| 2.133141411787476 | 0.846 | -0.902 | 0.116 |
| 2.136283004441065 | 0.844 | -0.905 | 0.125 |
| 2.139424597094655 | 0.843 | -0.907 | 0.135 |
| 2.142566189748245 | 0.841 | -0.91 | 0.144 |
| 2.145707782401834 | 0.839 | -0.913 | 0.153 |
| 2.148849375055424 | 0.838 | -0.915 | 0.163 |
| 2.151990967709013 | 0.836 | -0.918 | 0.172 |
| 2.155132560362603 | 0.834 | -0.92 | 0.181 |
| 2.158274153016193 | 0.832 | -0.923 | 0.19 |
| 2.161415745669782 | 0.831 | -0.925 | 0.2 |
| 2.164557338323372 | 0.829 | -0.927 | 0.209 |
| 2.167698930976961 | 0.827 | -0.93 | 0.218 |
| 2.170840523630551 | 0.825 | -0.932 | 0.227 |
| 2.173982116284141 | 0.824 | -0.934 | 0.236 |
| 2.17712370893773 | 0.822 | -0.937 | 0.246 |
| 2.18026530159132 | 0.82 | -0.939 | 0.255 |
| 2.183406894244909 | 0.818 | -0.941 | 0.264 |
| 2.186548486898499 | 0.816 | -0.943 | 0.273 |
| 2.189690079552089 | 0.815 | -0.945 | 0.282 |
| 2.192831672205678 | 0.813 | -0.947 | 0.291 |
| 2.195973264859268 | 0.811 | -0.949 | 0.3 |
| 2.199114857512857 | 0.809 | -0.951 | 0.309 |
| 2.202256450166447 | 0.807 | -0.953 | 0.318 |
| 2.205398042820036 | 0.805 | -0.955 | 0.327 |
| 2.208539635473626 | 0.803 | -0.957 | 0.336 |
| 2.211681228127216 | 0.802 | -0.959 | 0.345 |
| 2.214822820780805 | 0.8 | -0.96 | 0.353 |
| 2.217964413434395 | 0.798 | -0.962 | 0.362 |
| 2.221106006087984 | 0.796 | -0.964 | 0.371 |
| 2.224247598741574 | 0.794 | -0.965 | 0.38 |
| 2.227389191395164 | 0.792 | -0.967 | 0.388 |
| 2.230530784048753 | 0.79 | -0.969 | 0.397 |
| 2.233672376702343 | 0.788 | -0.97 | 0.406 |
| 2.236813969355933 | 0.786 | -0.972 | 0.414 |
| 2.239955562009522 | 0.784 | -0.973 | 0.423 |
| 2.243097154663112 | 0.782 | -0.975 | 0.431 |
| 2.246238747316701 | 0.78 | -0.976 | 0.44 |
| 2.249380339970291 | 0.778 | -0.977 | 0.448 |
| 2.252521932623881 | 0.776 | -0.979 | 0.457 |
| 2.25566352527747 | 0.775 | -0.98 | 0.465 |
| 2.25880511793106 | 0.773 | -0.981 | 0.473 |
| 2.261946710584649 | 0.771 | -0.982 | 0.482 |
| 2.265088303238239 | 0.769 | -0.983 | 0.49 |
| 2.268229895891829 | 0.766 | -0.985 | 0.498 |
| 2.271371488545418 | 0.764 | -0.986 | 0.506 |
| 2.274513081199008 | 0.762 | -0.987 | 0.514 |
| 2.277654673852597 | 0.76 | -0.988 | 0.522 |
| 2.280796266506186 | 0.758 | -0.989 | 0.531 |
| 2.283937859159776 | 0.756 | -0.99 | 0.538 |
| 2.287079451813366 | 0.754 | -0.99 | 0.546 |
| 2.290221044466955 | 0.752 | -0.991 | 0.554 |
| 2.293362637120545 | 0.75 | -0.992 | 0.562 |
| 2.296504229774135 | 0.748 | -0.993 | 0.57 |
| 2.299645822427724 | 0.746 | -0.994 | 0.578 |
| 2.302787415081314 | 0.744 | -0.994 | 0.585 |
| 2.305929007734904 | 0.742 | -0.995 | 0.593 |
| 2.309070600388493 | 0.74 | -0.996 | 0.6 |
| 2.312212193042083 | 0.738 | -0.996 | 0.608 |
| 2.315353785695672 | 0.735 | -0.997 | 0.615 |
| 2.318495378349262 | 0.733 | -0.997 | 0.623 |
| 2.321636971002852 | 0.731 | -0.998 | 0.63 |
| 2.324778563656441 | 0.729 | -0.998 | 0.637 |
| 2.327920156310031 | 0.727 | -0.998 | 0.645 |
| 2.33106174896362 | 0.725 | -0.999 | 0.652 |
| 2.33420334161721 | 0.722 | -0.999 | 0.659 |
| 2.3373449342708 | 0.72 | -0.999 | 0.666 |
| 2.340486526924389 | 0.718 | -1 | 0.673 |
| 2.343628119577979 | 0.716 | -1 | 0.68 |
| 2.346769712231568 | 0.714 | -1 | 0.687 |
| 2.349911304885158 | 0.712 | -1 | 0.694 |
| 2.353052897538748 | 0.709 | -1 | 0.7 |
| 2.356194490192337 | 0.707 | -1 | 0.707 |
| 2.359336082845927 | 0.705 | -1 | 0.714 |
| 2.362477675499516 | 0.703 | -1 | 0.72 |
| 2.365619268153106 | 0.7 | -1 | 0.727 |
| 2.368760860806696 | 0.698 | -1 | 0.733 |
| 2.371902453460285 | 0.696 | -1 | 0.74 |
| 2.375044046113875 | 0.694 | -0.999 | 0.746 |
| 2.378185638767464 | 0.691 | -0.999 | 0.752 |
| 2.381327231421054 | 0.689 | -0.999 | 0.758 |
| 2.384468824074644 | 0.687 | -0.998 | 0.764 |
| 2.387610416728233 | 0.685 | -0.998 | 0.771 |
| 2.390752009381823 | 0.682 | -0.998 | 0.776 |
| 2.393893602035412 | 0.68 | -0.997 | 0.782 |
| 2.397035194689002 | 0.678 | -0.997 | 0.788 |
| 2.400176787342591 | 0.675 | -0.996 | 0.794 |
| 2.403318379996181 | 0.673 | -0.996 | 0.8 |
| 2.406459972649771 | 0.671 | -0.995 | 0.805 |
| 2.40960156530336 | 0.668 | -0.994 | 0.811 |
| 2.41274315795695 | 0.666 | -0.994 | 0.816 |
| 2.41588475061054 | 0.664 | -0.993 | 0.822 |
| 2.419026343264129 | 0.661 | -0.992 | 0.827 |
| 2.422167935917719 | 0.659 | -0.991 | 0.832 |
| 2.425309528571308 | 0.657 | -0.99 | 0.838 |
| 2.428451121224898 | 0.654 | -0.99 | 0.843 |
| 2.431592713878488 | 0.652 | -0.989 | 0.848 |
| 2.434734306532077 | 0.649 | -0.988 | 0.853 |
| 2.437875899185667 | 0.647 | -0.987 | 0.858 |
| 2.441017491839256 | 0.645 | -0.986 | 0.862 |
| 2.444159084492846 | 0.642 | -0.985 | 0.867 |
| 2.447300677146435 | 0.64 | -0.983 | 0.872 |
| 2.450442269800025 | 0.637 | -0.982 | 0.876 |
| 2.453583862453615 | 0.635 | -0.981 | 0.881 |
| 2.456725455107204 | 0.633 | -0.98 | 0.885 |
| 2.459867047760794 | 0.63 | -0.979 | 0.89 |
| 2.463008640414384 | 0.628 | -0.977 | 0.894 |
| 2.466150233067973 | 0.625 | -0.976 | 0.898 |
| 2.469291825721563 | 0.623 | -0.975 | 0.902 |
| 2.472433418375152 | 0.62 | -0.973 | 0.906 |
| 2.475575011028742 | 0.618 | -0.972 | 0.91 |
| 2.478716603682332 | 0.615 | -0.97 | 0.914 |
| 2.481858196335921 | 0.613 | -0.969 | 0.918 |
| 2.48499978898951 | 0.61 | -0.967 | 0.921 |
| 2.4881413816431 | 0.608 | -0.965 | 0.925 |
| 2.49128297429669 | 0.605 | -0.964 | 0.929 |
| 2.49442456695028 | 0.603 | -0.962 | 0.932 |
| 2.497566159603869 | 0.6 | -0.96 | 0.935 |
| 2.500707752257458 | 0.598 | -0.959 | 0.939 |
| 2.503849344911048 | 0.595 | -0.957 | 0.942 |
| 2.506990937564638 | 0.593 | -0.955 | 0.945 |
| 2.510132530218228 | 0.59 | -0.953 | 0.948 |
| 2.513274122871817 | 0.588 | -0.951 | 0.951 |
| 2.516415715525407 | 0.585 | -0.949 | 0.954 |
| 2.519557308178996 | 0.583 | -0.947 | 0.957 |
| 2.522698900832586 | 0.58 | -0.945 | 0.959 |
| 2.525840493486176 | 0.578 | -0.943 | 0.962 |
| 2.528982086139765 | 0.575 | -0.941 | 0.965 |
| 2.532123678793355 | 0.572 | -0.939 | 0.967 |
| 2.535265271446944 | 0.57 | -0.937 | 0.969 |
| 2.538406864100534 | 0.567 | -0.934 | 0.972 |
| 2.541548456754124 | 0.565 | -0.932 | 0.974 |
| 2.544690049407713 | 0.562 | -0.93 | 0.976 |
| 2.547831642061302 | 0.559 | -0.927 | 0.978 |
| 2.550973234714892 | 0.557 | -0.925 | 0.98 |
| 2.554114827368482 | 0.554 | -0.923 | 0.982 |
| 2.557256420022072 | 0.552 | -0.92 | 0.983 |
| 2.560398012675661 | 0.549 | -0.918 | 0.985 |
| 2.563539605329251 | 0.546 | -0.915 | 0.987 |
| 2.56668119798284 | 0.544 | -0.913 | 0.988 |
| 2.56982279063643 | 0.541 | -0.91 | 0.99 |
| 2.57296438329002 | 0.538 | -0.907 | 0.991 |
| 2.576105975943609 | 0.536 | -0.905 | 0.992 |
| 2.579247568597199 | 0.533 | -0.902 | 0.993 |
| 2.582389161250788 | 0.531 | -0.899 | 0.994 |
| 2.585530753904377 | 0.528 | -0.897 | 0.995 |
| 2.588672346557967 | 0.525 | -0.894 | 0.996 |
| 2.591813939211557 | 0.522 | -0.891 | 0.997 |
| 2.594955531865147 | 0.52 | -0.888 | 0.998 |
| 2.598097124518736 | 0.517 | -0.885 | 0.998 |
| 2.601238717172326 | 0.514 | -0.882 | 0.999 |
| 2.604380309825915 | 0.512 | -0.879 | 0.999 |
| 2.607521902479505 | 0.509 | -0.876 | 1 |
| 2.610663495133095 | 0.506 | -0.873 | 1 |
| 2.613805087786684 | 0.504 | -0.87 | 1 |
| 2.616946680440274 | 0.501 | -0.867 | 1 |
| 2.620088273093863 | 0.498 | -0.864 | 1 |
| 2.623229865747452 | 0.495 | -0.861 | 1 |
| 2.626371458401042 | 0.493 | -0.858 | 1 |
| 2.629513051054632 | 0.49 | -0.854 | 0.999 |
| 2.632654643708222 | 0.487 | -0.851 | 0.999 |
| 2.635796236361811 | 0.485 | -0.848 | 0.999 |
| 2.638937829015401 | 0.482 | -0.844 | 0.998 |
| 2.642079421668991 | 0.479 | -0.841 | 0.997 |
| 2.64522101432258 | 0.476 | -0.838 | 0.997 |
| 2.64836260697617 | 0.473 | -0.834 | 0.996 |
| 2.651504199629759 | 0.471 | -0.831 | 0.995 |
| 2.654645792283349 | 0.468 | -0.827 | 0.994 |
| 2.657787384936938 | 0.465 | -0.824 | 0.993 |
| 2.660928977590528 | 0.462 | -0.82 | 0.992 |
| 2.664070570244118 | 0.46 | -0.816 | 0.99 |
| 2.667212162897707 | 0.457 | -0.813 | 0.989 |
| 2.670353755551297 | 0.454 | -0.809 | 0.988 |
| 2.673495348204887 | 0.451 | -0.805 | 0.986 |
| 2.676636940858476 | 0.448 | -0.802 | 0.985 |
| 2.679778533512066 | 0.446 | -0.798 | 0.983 |
| 2.682920126165655 | 0.443 | -0.794 | 0.981 |
| 2.686061718819245 | 0.44 | -0.79 | 0.979 |
| 2.689203311472835 | 0.437 | -0.786 | 0.977 |
| 2.692344904126424 | 0.434 | -0.782 | 0.975 |
| 2.695486496780014 | 0.431 | -0.778 | 0.973 |
| 2.698628089433603 | 0.429 | -0.775 | 0.971 |
| 2.701769682087193 | 0.426 | -0.771 | 0.969 |
| 2.704911274740782 | 0.423 | -0.766 | 0.966 |
| 2.708052867394372 | 0.42 | -0.762 | 0.964 |
| 2.711194460047962 | 0.417 | -0.758 | 0.961 |
| 2.714336052701551 | 0.414 | -0.754 | 0.959 |
| 2.717477645355141 | 0.412 | -0.75 | 0.956 |
| 2.720619238008731 | 0.409 | -0.746 | 0.953 |
| 2.72376083066232 | 0.406 | -0.742 | 0.95 |
| 2.72690242331591 | 0.403 | -0.738 | 0.947 |
| 2.730044015969499 | 0.4 | -0.733 | 0.944 |
| 2.733185608623089 | 0.397 | -0.729 | 0.941 |
| 2.736327201276678 | 0.394 | -0.725 | 0.938 |
| 2.739468793930268 | 0.391 | -0.72 | 0.934 |
| 2.742610386583858 | 0.388 | -0.716 | 0.931 |
| 2.745751979237447 | 0.386 | -0.712 | 0.927 |
| 2.748893571891036 | 0.383 | -0.707 | 0.924 |
| 2.752035164544627 | 0.38 | -0.703 | 0.92 |
| 2.755176757198216 | 0.377 | -0.698 | 0.917 |
| 2.758318349851806 | 0.374 | -0.694 | 0.913 |
| 2.761459942505395 | 0.371 | -0.689 | 0.909 |
| 2.764601535158985 | 0.368 | -0.685 | 0.905 |
| 2.767743127812574 | 0.365 | -0.68 | 0.901 |
| 2.770884720466164 | 0.362 | -0.675 | 0.897 |
| 2.774026313119754 | 0.359 | -0.671 | 0.892 |
| 2.777167905773343 | 0.356 | -0.666 | 0.888 |
| 2.780309498426932 | 0.353 | -0.661 | 0.884 |
| 2.783451091080522 | 0.351 | -0.657 | 0.879 |
| 2.786592683734112 | 0.348 | -0.652 | 0.875 |
| 2.789734276387701 | 0.345 | -0.647 | 0.87 |
| 2.792875869041291 | 0.342 | -0.642 | 0.866 |
| 2.796017461694881 | 0.339 | -0.637 | 0.861 |
| 2.79915905434847 | 0.336 | -0.633 | 0.856 |
| 2.80230064700206 | 0.333 | -0.628 | 0.851 |
| 2.80544223965565 | 0.33 | -0.623 | 0.846 |
| 2.808583832309239 | 0.327 | -0.618 | 0.841 |
| 2.811725424962829 | 0.324 | -0.613 | 0.836 |
| 2.814867017616419 | 0.321 | -0.608 | 0.831 |
| 2.818008610270008 | 0.318 | -0.603 | 0.825 |
| 2.821150202923598 | 0.315 | -0.598 | 0.82 |
| 2.824291795577187 | 0.312 | -0.593 | 0.815 |
| 2.827433388230777 | 0.309 | -0.588 | 0.809 |
| 2.830574980884366 | 0.306 | -0.583 | 0.803 |
| 2.833716573537956 | 0.303 | -0.578 | 0.798 |
| 2.836858166191546 | 0.3 | -0.572 | 0.792 |
| 2.839999758845135 | 0.297 | -0.567 | 0.786 |
| 2.843141351498725 | 0.294 | -0.562 | 0.78 |
| 2.846282944152314 | 0.291 | -0.557 | 0.775 |
| 2.849424536805904 | 0.288 | -0.552 | 0.769 |
| 2.852566129459494 | 0.285 | -0.546 | 0.762 |
| 2.855707722113083 | 0.282 | -0.541 | 0.756 |
| 2.858849314766673 | 0.279 | -0.536 | 0.75 |
| 2.861990907420262 | 0.276 | -0.531 | 0.744 |
| 2.865132500073852 | 0.273 | -0.525 | 0.738 |
| 2.868274092727442 | 0.27 | -0.52 | 0.731 |
| 2.871415685381031 | 0.267 | -0.514 | 0.725 |
| 2.874557278034621 | 0.264 | -0.509 | 0.718 |
| 2.87769887068821 | 0.261 | -0.504 | 0.712 |
| 2.8808404633418 | 0.258 | -0.498 | 0.705 |
| 2.88398205599539 | 0.255 | -0.493 | 0.698 |
| 2.88712364864898 | 0.252 | -0.487 | 0.691 |
| 2.890265241302569 | 0.249 | -0.482 | 0.685 |
| 2.893406833956158 | 0.246 | -0.476 | 0.678 |
| 2.896548426609748 | 0.243 | -0.471 | 0.671 |
| 2.899690019263338 | 0.24 | -0.465 | 0.664 |
| 2.902831611916927 | 0.236 | -0.46 | 0.657 |
| 2.905973204570517 | 0.233 | -0.454 | 0.649 |
| 2.909114797224106 | 0.23 | -0.448 | 0.642 |
| 2.912256389877696 | 0.227 | -0.443 | 0.635 |
| 2.915397982531286 | 0.224 | -0.437 | 0.628 |
| 2.918539575184875 | 0.221 | -0.431 | 0.62 |
| 2.921681167838465 | 0.218 | -0.426 | 0.613 |
| 2.924822760492054 | 0.215 | -0.42 | 0.605 |
| 2.927964353145644 | 0.212 | -0.414 | 0.598 |
| 2.931105945799234 | 0.209 | -0.409 | 0.59 |
| 2.934247538452823 | 0.206 | -0.403 | 0.583 |
| 2.937389131106413 | 0.203 | -0.397 | 0.575 |
| 2.940530723760002 | 0.2 | -0.391 | 0.567 |
| 2.943672316413592 | 0.197 | -0.386 | 0.559 |
| 2.946813909067182 | 0.194 | -0.38 | 0.552 |
| 2.949955501720771 | 0.19 | -0.374 | 0.544 |
| 2.953097094374361 | 0.187 | -0.368 | 0.536 |
| 2.95623868702795 | 0.184 | -0.362 | 0.528 |
| 2.95938027968154 | 0.181 | -0.356 | 0.52 |
| 2.96252187233513 | 0.178 | -0.351 | 0.512 |
| 2.965663464988719 | 0.175 | -0.345 | 0.504 |
| 2.968805057642309 | 0.172 | -0.339 | 0.495 |
| 2.971946650295898 | 0.169 | -0.333 | 0.487 |
| 2.975088242949488 | 0.166 | -0.327 | 0.479 |
| 2.978229835603078 | 0.163 | -0.321 | 0.471 |
| 2.981371428256667 | 0.16 | -0.315 | 0.462 |
| 2.984513020910257 | 0.156 | -0.309 | 0.454 |
| 2.987654613563846 | 0.153 | -0.303 | 0.446 |
| 2.990796206217436 | 0.15 | -0.297 | 0.437 |
| 2.993937798871025 | 0.147 | -0.291 | 0.429 |
| 2.997079391524615 | 0.144 | -0.285 | 0.42 |
| 3.000220984178205 | 0.141 | -0.279 | 0.412 |
| 3.003362576831794 | 0.138 | -0.273 | 0.403 |
| 3.006504169485384 | 0.135 | -0.267 | 0.394 |
| 3.009645762138974 | 0.132 | -0.261 | 0.386 |
| 3.012787354792563 | 0.128 | -0.255 | 0.377 |
| 3.015928947446153 | 0.125 | -0.249 | 0.368 |
| 3.019070540099742 | 0.122 | -0.243 | 0.359 |
| 3.022212132753332 | 0.119 | -0.236 | 0.351 |
| 3.025353725406922 | 0.116 | -0.23 | 0.342 |
| 3.028495318060511 | 0.113 | -0.224 | 0.333 |
| 3.031636910714101 | 0.11 | -0.218 | 0.324 |
| 3.03477850336769 | 0.107 | -0.212 | 0.315 |
| 3.03792009602128 | 0.103 | -0.206 | 0.306 |
| 3.04106168867487 | 0.1 | -0.2 | 0.297 |
| 3.04420328132846 | 0.097 | -0.194 | 0.288 |
| 3.047344873982049 | 0.094 | -0.187 | 0.279 |
| 3.050486466635638 | 0.091 | -0.181 | 0.27 |
| 3.053628059289228 | 0.088 | -0.175 | 0.261 |
| 3.056769651942818 | 0.085 | -0.169 | 0.252 |
| 3.059911244596407 | 0.082 | -0.163 | 0.243 |
| 3.063052837249997 | 0.078 | -0.156 | 0.233 |
| 3.066194429903586 | 0.075 | -0.15 | 0.224 |
| 3.069336022557176 | 0.072 | -0.144 | 0.215 |
| 3.072477615210766 | 0.069 | -0.138 | 0.206 |
| 3.075619207864355 | 0.066 | -0.132 | 0.197 |
| 3.078760800517945 | 0.063 | -0.125 | 0.187 |
| 3.081902393171534 | 0.06 | -0.119 | 0.178 |
| 3.085043985825124 | 0.057 | -0.113 | 0.169 |
| 3.088185578478713 | 0.053 | -0.107 | 0.16 |
| 3.091327171132303 | 0.05 | -0.1 | 0.15 |
| 3.094468763785893 | 0.047 | -0.094 | 0.141 |
| 3.097610356439482 | 0.044 | -0.088 | 0.132 |
| 3.100751949093072 | 0.041 | -0.082 | 0.122 |
| 3.103893541746661 | 0.038 | -0.075 | 0.113 |
| 3.107035134400251 | 0.035 | -0.069 | 0.103 |
| 3.110176727053841 | 0.031 | -0.063 | 0.094 |
| 3.11331831970743 | 0.028 | -0.057 | 0.085 |
| 3.11645991236102 | 0.025 | -0.05 | 0.075 |
| 3.11960150501461 | 0.022 | -0.044 | 0.066 |
| 3.122743097668199 | 0.019 | -0.038 | 0.057 |
| 3.125884690321789 | 0.016 | -0.031 | 0.047 |
| 3.129026282975378 | 0.013 | -0.025 | 0.038 |
| 3.132167875628968 | 0.009 | -0.019 | 0.028 |
| 3.135309468282557 | 0.006 | -0.013 | 0.019 |
| 3.138451060936147 | 0.003 | -0.006 | 0.009 |
| 3.141592653589737 | 0 | 0 | 0 |
| 3.144734246243326 | -0.003 | 0.006 | -0.009 |
| 3.147875838896916 | -0.006 | 0.013 | -0.019 |
| 3.151017431550505 | -0.009 | 0.019 | -0.028 |
| 3.154159024204095 | -0.013 | 0.025 | -0.038 |
| 3.157300616857685 | -0.016 | 0.031 | -0.047 |
| 3.160442209511274 | -0.019 | 0.038 | -0.057 |
| 3.163583802164864 | -0.022 | 0.044 | -0.066 |
| 3.166725394818453 | -0.025 | 0.05 | -0.075 |
| 3.169866987472043 | -0.028 | 0.057 | -0.085 |
| 3.173008580125633 | -0.031 | 0.063 | -0.094 |
| 3.176150172779222 | -0.035 | 0.069 | -0.103 |
| 3.179291765432812 | -0.038 | 0.075 | -0.113 |
| 3.182433358086401 | -0.041 | 0.082 | -0.122 |
| 3.185574950739991 | -0.044 | 0.088 | -0.132 |
| 3.188716543393581 | -0.047 | 0.094 | -0.141 |
| 3.19185813604717 | -0.05 | 0.1 | -0.15 |
| 3.19499972870076 | -0.053 | 0.107 | -0.16 |
| 3.198141321354349 | -0.057 | 0.113 | -0.169 |
| 3.20128291400794 | -0.06 | 0.119 | -0.178 |
| 3.204424506661528 | -0.063 | 0.125 | -0.187 |
| 3.207566099315118 | -0.066 | 0.132 | -0.197 |
| 3.210707691968708 | -0.069 | 0.138 | -0.206 |
| 3.213849284622297 | -0.072 | 0.144 | -0.215 |
| 3.216990877275887 | -0.075 | 0.15 | -0.224 |
| 3.220132469929476 | -0.078 | 0.156 | -0.233 |
| 3.223274062583066 | -0.082 | 0.163 | -0.243 |
| 3.226415655236656 | -0.085 | 0.169 | -0.252 |
| 3.229557247890245 | -0.088 | 0.175 | -0.261 |
| 3.232698840543835 | -0.091 | 0.181 | -0.27 |
| 3.235840433197425 | -0.094 | 0.187 | -0.279 |
| 3.238982025851014 | -0.097 | 0.194 | -0.288 |
| 3.242123618504604 | -0.1 | 0.2 | -0.297 |
| 3.245265211158193 | -0.103 | 0.206 | -0.306 |
| 3.248406803811783 | -0.107 | 0.212 | -0.315 |
| 3.251548396465373 | -0.11 | 0.218 | -0.324 |
| 3.254689989118962 | -0.113 | 0.224 | -0.333 |
| 3.257831581772551 | -0.116 | 0.23 | -0.342 |
| 3.260973174426141 | -0.119 | 0.236 | -0.351 |
| 3.26411476707973 | -0.122 | 0.243 | -0.359 |
| 3.267256359733321 | -0.125 | 0.249 | -0.368 |
| 3.27039795238691 | -0.128 | 0.255 | -0.377 |
| 3.2735395450405 | -0.132 | 0.261 | -0.386 |
| 3.276681137694089 | -0.135 | 0.267 | -0.394 |
| 3.279822730347679 | -0.138 | 0.273 | -0.403 |
| 3.282964323001269 | -0.141 | 0.279 | -0.412 |
| 3.286105915654858 | -0.144 | 0.285 | -0.42 |
| 3.289247508308448 | -0.147 | 0.291 | -0.429 |
| 3.292389100962037 | -0.15 | 0.297 | -0.437 |
| 3.295530693615627 | -0.153 | 0.303 | -0.446 |
| 3.298672286269217 | -0.156 | 0.309 | -0.454 |
| 3.301813878922806 | -0.16 | 0.315 | -0.462 |
| 3.304955471576396 | -0.163 | 0.321 | -0.471 |
| 3.308097064229985 | -0.166 | 0.327 | -0.479 |
| 3.311238656883575 | -0.169 | 0.333 | -0.487 |
| 3.314380249537165 | -0.172 | 0.339 | -0.495 |
| 3.317521842190754 | -0.175 | 0.345 | -0.504 |
| 3.320663434844344 | -0.178 | 0.351 | -0.512 |
| 3.323805027497933 | -0.181 | 0.356 | -0.52 |
| 3.326946620151523 | -0.184 | 0.362 | -0.528 |
| 3.330088212805113 | -0.187 | 0.368 | -0.536 |
| 3.333229805458702 | -0.19 | 0.374 | -0.544 |
| 3.336371398112292 | -0.194 | 0.38 | -0.552 |
| 3.339512990765881 | -0.197 | 0.386 | -0.559 |
| 3.342654583419471 | -0.2 | 0.391 | -0.567 |
| 3.345796176073061 | -0.203 | 0.397 | -0.575 |
| 3.34893776872665 | -0.206 | 0.403 | -0.583 |
| 3.35207936138024 | -0.209 | 0.409 | -0.59 |
| 3.355220954033829 | -0.212 | 0.414 | -0.598 |
| 3.358362546687419 | -0.215 | 0.42 | -0.605 |
| 3.361504139341009 | -0.218 | 0.426 | -0.613 |
| 3.364645731994598 | -0.221 | 0.431 | -0.62 |
| 3.367787324648188 | -0.224 | 0.437 | -0.628 |
| 3.370928917301777 | -0.227 | 0.443 | -0.635 |
| 3.374070509955367 | -0.23 | 0.448 | -0.642 |
| 3.377212102608956 | -0.233 | 0.454 | -0.649 |
| 3.380353695262546 | -0.236 | 0.46 | -0.657 |
| 3.383495287916136 | -0.24 | 0.465 | -0.664 |
| 3.386636880569725 | -0.243 | 0.471 | -0.671 |
| 3.389778473223315 | -0.246 | 0.476 | -0.678 |
| 3.392920065876904 | -0.249 | 0.482 | -0.685 |
| 3.396061658530494 | -0.252 | 0.487 | -0.691 |
| 3.399203251184084 | -0.255 | 0.493 | -0.698 |
| 3.402344843837673 | -0.258 | 0.498 | -0.705 |
| 3.405486436491263 | -0.261 | 0.504 | -0.712 |
| 3.408628029144852 | -0.264 | 0.509 | -0.718 |
| 3.411769621798442 | -0.267 | 0.514 | -0.725 |
| 3.414911214452032 | -0.27 | 0.52 | -0.731 |
| 3.418052807105621 | -0.273 | 0.525 | -0.738 |
| 3.421194399759211 | -0.276 | 0.531 | -0.744 |
| 3.4243359924128 | -0.279 | 0.536 | -0.75 |
| 3.42747758506639 | -0.282 | 0.541 | -0.756 |
| 3.43061917771998 | -0.285 | 0.546 | -0.762 |
| 3.433760770373569 | -0.288 | 0.552 | -0.769 |
| 3.436902363027159 | -0.291 | 0.557 | -0.775 |
| 3.440043955680748 | -0.294 | 0.562 | -0.78 |
| 3.443185548334338 | -0.297 | 0.567 | -0.786 |
| 3.446327140987927 | -0.3 | 0.572 | -0.792 |
| 3.449468733641517 | -0.303 | 0.578 | -0.798 |
| 3.452610326295107 | -0.306 | 0.583 | -0.803 |
| 3.455751918948696 | -0.309 | 0.588 | -0.809 |
| 3.458893511602286 | -0.312 | 0.593 | -0.815 |
| 3.462035104255876 | -0.315 | 0.598 | -0.82 |
| 3.465176696909465 | -0.318 | 0.603 | -0.825 |
| 3.468318289563055 | -0.321 | 0.608 | -0.831 |
| 3.471459882216644 | -0.324 | 0.613 | -0.836 |
| 3.474601474870234 | -0.327 | 0.618 | -0.841 |
| 3.477743067523824 | -0.33 | 0.623 | -0.846 |
| 3.480884660177413 | -0.333 | 0.628 | -0.851 |
| 3.484026252831002 | -0.336 | 0.633 | -0.856 |
| 3.487167845484592 | -0.339 | 0.637 | -0.861 |
| 3.490309438138182 | -0.342 | 0.642 | -0.866 |
| 3.493451030791772 | -0.345 | 0.647 | -0.87 |
| 3.496592623445361 | -0.348 | 0.652 | -0.875 |
| 3.499734216098951 | -0.351 | 0.657 | -0.879 |
| 3.50287580875254 | -0.353 | 0.661 | -0.884 |
| 3.50601740140613 | -0.356 | 0.666 | -0.888 |
| 3.50915899405972 | -0.359 | 0.671 | -0.892 |
| 3.512300586713309 | -0.362 | 0.675 | -0.897 |
| 3.515442179366899 | -0.365 | 0.68 | -0.901 |
| 3.518583772020488 | -0.368 | 0.685 | -0.905 |
| 3.521725364674078 | -0.371 | 0.689 | -0.909 |
| 3.524866957327668 | -0.374 | 0.694 | -0.913 |
| 3.528008549981257 | -0.377 | 0.698 | -0.917 |
| 3.531150142634847 | -0.38 | 0.703 | -0.92 |
| 3.534291735288436 | -0.383 | 0.707 | -0.924 |
| 3.537433327942026 | -0.386 | 0.712 | -0.927 |
| 3.540574920595616 | -0.388 | 0.716 | -0.931 |
| 3.543716513249205 | -0.391 | 0.72 | -0.934 |
| 3.546858105902795 | -0.394 | 0.725 | -0.938 |
| 3.549999698556384 | -0.397 | 0.729 | -0.941 |
| 3.553141291209974 | -0.4 | 0.733 | -0.944 |
| 3.556282883863564 | -0.403 | 0.738 | -0.947 |
| 3.559424476517153 | -0.406 | 0.742 | -0.95 |
| 3.562566069170743 | -0.409 | 0.746 | -0.953 |
| 3.565707661824332 | -0.412 | 0.75 | -0.956 |
| 3.568849254477922 | -0.414 | 0.754 | -0.959 |
| 3.571990847131511 | -0.417 | 0.758 | -0.961 |
| 3.575132439785101 | -0.42 | 0.762 | -0.964 |
| 3.578274032438691 | -0.423 | 0.766 | -0.966 |
| 3.58141562509228 | -0.426 | 0.771 | -0.969 |
| 3.58455721774587 | -0.429 | 0.775 | -0.971 |
| 3.58769881039946 | -0.431 | 0.778 | -0.973 |
| 3.590840403053049 | -0.434 | 0.782 | -0.975 |
| 3.593981995706639 | -0.437 | 0.786 | -0.977 |
| 3.597123588360228 | -0.44 | 0.79 | -0.979 |
| 3.600265181013818 | -0.443 | 0.794 | -0.981 |
| 3.603406773667407 | -0.446 | 0.798 | -0.983 |
| 3.606548366320997 | -0.448 | 0.802 | -0.985 |
| 3.609689958974587 | -0.451 | 0.805 | -0.986 |
| 3.612831551628176 | -0.454 | 0.809 | -0.988 |
| 3.615973144281766 | -0.457 | 0.813 | -0.989 |
| 3.619114736935355 | -0.46 | 0.816 | -0.99 |
| 3.622256329588945 | -0.462 | 0.82 | -0.992 |
| 3.625397922242534 | -0.465 | 0.824 | -0.993 |
| 3.628539514896124 | -0.468 | 0.827 | -0.994 |
| 3.631681107549714 | -0.471 | 0.831 | -0.995 |
| 3.634822700203303 | -0.473 | 0.834 | -0.996 |
| 3.637964292856893 | -0.476 | 0.838 | -0.997 |
| 3.641105885510483 | -0.479 | 0.841 | -0.997 |
| 3.644247478164072 | -0.482 | 0.844 | -0.998 |
| 3.647389070817662 | -0.485 | 0.848 | -0.999 |
| 3.650530663471251 | -0.487 | 0.851 | -0.999 |
| 3.653672256124841 | -0.49 | 0.854 | -0.999 |
| 3.656813848778431 | -0.493 | 0.858 | -1 |
| 3.65995544143202 | -0.495 | 0.861 | -1 |
| 3.66309703408561 | -0.498 | 0.864 | -1 |
| 3.666238626739199 | -0.501 | 0.867 | -1 |
| 3.66938021939279 | -0.504 | 0.87 | -1 |
| 3.672521812046378 | -0.506 | 0.873 | -1 |
| 3.675663404699968 | -0.509 | 0.876 | -1 |
| 3.678804997353558 | -0.512 | 0.879 | -0.999 |
| 3.681946590007147 | -0.514 | 0.882 | -0.999 |
| 3.685088182660737 | -0.517 | 0.885 | -0.998 |
| 3.688229775314326 | -0.52 | 0.888 | -0.998 |
| 3.691371367967916 | -0.522 | 0.891 | -0.997 |
| 3.694512960621506 | -0.525 | 0.894 | -0.996 |
| 3.697654553275095 | -0.528 | 0.897 | -0.995 |
| 3.700796145928685 | -0.531 | 0.899 | -0.994 |
| 3.703937738582274 | -0.533 | 0.902 | -0.993 |
| 3.707079331235864 | -0.536 | 0.905 | -0.992 |
| 3.710220923889454 | -0.538 | 0.907 | -0.991 |
| 3.713362516543043 | -0.541 | 0.91 | -0.99 |
| 3.716504109196633 | -0.544 | 0.913 | -0.988 |
| 3.719645701850223 | -0.546 | 0.915 | -0.987 |
| 3.722787294503812 | -0.549 | 0.918 | -0.985 |
| 3.725928887157402 | -0.552 | 0.92 | -0.983 |
| 3.729070479810991 | -0.554 | 0.923 | -0.982 |
| 3.732212072464581 | -0.557 | 0.925 | -0.98 |
| 3.735353665118171 | -0.559 | 0.927 | -0.978 |
| 3.73849525777176 | -0.562 | 0.93 | -0.976 |
| 3.74163685042535 | -0.565 | 0.932 | -0.974 |
| 3.744778443078939 | -0.567 | 0.934 | -0.972 |
| 3.747920035732529 | -0.57 | 0.937 | -0.969 |
| 3.751061628386119 | -0.572 | 0.939 | -0.967 |
| 3.754203221039708 | -0.575 | 0.941 | -0.965 |
| 3.757344813693298 | -0.578 | 0.943 | -0.962 |
| 3.760486406346887 | -0.58 | 0.945 | -0.959 |
| 3.763627999000477 | -0.583 | 0.947 | -0.957 |
| 3.766769591654067 | -0.585 | 0.949 | -0.954 |
| 3.769911184307656 | -0.588 | 0.951 | -0.951 |
| 3.773052776961246 | -0.59 | 0.953 | -0.948 |
| 3.776194369614835 | -0.593 | 0.955 | -0.945 |
| 3.779335962268425 | -0.595 | 0.957 | -0.942 |
| 3.782477554922014 | -0.598 | 0.959 | -0.939 |
| 3.785619147575604 | -0.6 | 0.96 | -0.935 |
| 3.788760740229193 | -0.603 | 0.962 | -0.932 |
| 3.791902332882783 | -0.605 | 0.964 | -0.929 |
| 3.795043925536373 | -0.608 | 0.965 | -0.925 |
| 3.798185518189962 | -0.61 | 0.967 | -0.921 |
| 3.801327110843552 | -0.613 | 0.969 | -0.918 |
| 3.804468703497142 | -0.615 | 0.97 | -0.914 |
| 3.807610296150731 | -0.618 | 0.972 | -0.91 |
| 3.810751888804321 | -0.62 | 0.973 | -0.906 |
| 3.813893481457911 | -0.623 | 0.975 | -0.902 |
| 3.8170350741115 | -0.625 | 0.976 | -0.898 |
| 3.82017666676509 | -0.628 | 0.977 | -0.894 |
| 3.823318259418679 | -0.63 | 0.979 | -0.89 |
| 3.826459852072269 | -0.633 | 0.98 | -0.885 |
| 3.829601444725859 | -0.635 | 0.981 | -0.881 |
| 3.832743037379448 | -0.637 | 0.982 | -0.876 |
| 3.835884630033038 | -0.64 | 0.983 | -0.872 |
| 3.839026222686627 | -0.642 | 0.985 | -0.867 |
| 3.842167815340217 | -0.645 | 0.986 | -0.862 |
| 3.845309407993807 | -0.647 | 0.987 | -0.858 |
| 3.848451000647396 | -0.649 | 0.988 | -0.853 |
| 3.851592593300986 | -0.652 | 0.989 | -0.848 |
| 3.854734185954575 | -0.654 | 0.99 | -0.843 |
| 3.857875778608165 | -0.657 | 0.99 | -0.838 |
| 3.861017371261755 | -0.659 | 0.991 | -0.832 |
| 3.864158963915344 | -0.661 | 0.992 | -0.827 |
| 3.867300556568933 | -0.664 | 0.993 | -0.822 |
| 3.870442149222523 | -0.666 | 0.994 | -0.816 |
| 3.873583741876112 | -0.668 | 0.994 | -0.811 |
| 3.876725334529703 | -0.671 | 0.995 | -0.805 |
| 3.879866927183292 | -0.673 | 0.996 | -0.8 |
| 3.883008519836882 | -0.675 | 0.996 | -0.794 |
| 3.886150112490471 | -0.678 | 0.997 | -0.788 |
| 3.889291705144061 | -0.68 | 0.997 | -0.782 |
| 3.892433297797651 | -0.682 | 0.998 | -0.776 |
| 3.89557489045124 | -0.685 | 0.998 | -0.771 |
| 3.89871648310483 | -0.687 | 0.998 | -0.764 |
| 3.901858075758419 | -0.689 | 0.999 | -0.758 |
| 3.904999668412009 | -0.691 | 0.999 | -0.752 |
| 3.908141261065598 | -0.694 | 0.999 | -0.746 |
| 3.911282853719188 | -0.696 | 1 | -0.74 |
| 3.914424446372778 | -0.698 | 1 | -0.733 |
| 3.917566039026367 | -0.7 | 1 | -0.727 |
| 3.920707631679957 | -0.703 | 1 | -0.72 |
| 3.923849224333547 | -0.705 | 1 | -0.714 |
| 3.926990816987136 | -0.707 | 1 | -0.707 |
| 3.930132409640726 | -0.709 | 1 | -0.7 |
| 3.933274002294315 | -0.712 | 1 | -0.694 |
| 3.936415594947905 | -0.714 | 1 | -0.687 |
| 3.939557187601495 | -0.716 | 1 | -0.68 |
| 3.942698780255084 | -0.718 | 1 | -0.673 |
| 3.945840372908674 | -0.72 | 0.999 | -0.666 |
| 3.948981965562263 | -0.722 | 0.999 | -0.659 |
| 3.952123558215853 | -0.725 | 0.999 | -0.652 |
| 3.955265150869442 | -0.727 | 0.998 | -0.645 |
| 3.958406743523032 | -0.729 | 0.998 | -0.637 |
| 3.961548336176622 | -0.731 | 0.998 | -0.63 |
| 3.964689928830211 | -0.733 | 0.997 | -0.623 |
| 3.967831521483801 | -0.735 | 0.997 | -0.615 |
| 3.97097311413739 | -0.738 | 0.996 | -0.608 |
| 3.97411470679098 | -0.74 | 0.996 | -0.6 |
| 3.97725629944457 | -0.742 | 0.995 | -0.593 |
| 3.98039789209816 | -0.744 | 0.994 | -0.585 |
| 3.983539484751749 | -0.746 | 0.994 | -0.578 |
| 3.986681077405338 | -0.748 | 0.993 | -0.57 |
| 3.989822670058928 | -0.75 | 0.992 | -0.562 |
| 3.992964262712517 | -0.752 | 0.991 | -0.554 |
| 3.996105855366107 | -0.754 | 0.99 | -0.546 |
| 3.999247448019697 | -0.756 | 0.99 | -0.538 |
| 4.002389040673287 | -0.758 | 0.989 | -0.531 |
| 4.005530633326877 | -0.76 | 0.988 | -0.522 |
| 4.008672225980466 | -0.762 | 0.987 | -0.514 |
| 4.011813818634056 | -0.764 | 0.986 | -0.506 |
| 4.014955411287645 | -0.766 | 0.985 | -0.498 |
| 4.018097003941234 | -0.769 | 0.983 | -0.49 |
| 4.021238596594824 | -0.771 | 0.982 | -0.482 |
| 4.024380189248414 | -0.773 | 0.981 | -0.473 |
| 4.027521781902004 | -0.775 | 0.98 | -0.465 |
| 4.030663374555593 | -0.776 | 0.979 | -0.457 |
| 4.033804967209183 | -0.778 | 0.977 | -0.448 |
| 4.036946559862773 | -0.78 | 0.976 | -0.44 |
| 4.040088152516362 | -0.782 | 0.975 | -0.431 |
| 4.043229745169951 | -0.784 | 0.973 | -0.423 |
| 4.046371337823541 | -0.786 | 0.972 | -0.414 |
| 4.049512930477131 | -0.788 | 0.97 | -0.406 |
| 4.05265452313072 | -0.79 | 0.969 | -0.397 |
| 4.05579611578431 | -0.792 | 0.967 | -0.388 |
| 4.0589377084379 | -0.794 | 0.965 | -0.38 |
| 4.062079301091489 | -0.796 | 0.964 | -0.371 |
| 4.065220893745079 | -0.798 | 0.962 | -0.362 |
| 4.068362486398668 | -0.8 | 0.96 | -0.353 |
| 4.071504079052258 | -0.802 | 0.959 | -0.345 |
| 4.074645671705848 | -0.803 | 0.957 | -0.336 |
| 4.077787264359437 | -0.805 | 0.955 | -0.327 |
| 4.080928857013027 | -0.807 | 0.953 | -0.318 |
| 4.084070449666616 | -0.809 | 0.951 | -0.309 |
| 4.087212042320206 | -0.811 | 0.949 | -0.3 |
| 4.090353634973795 | -0.813 | 0.947 | -0.291 |
| 4.093495227627385 | -0.815 | 0.945 | -0.282 |
| 4.096636820280975 | -0.816 | 0.943 | -0.273 |
| 4.099778412934564 | -0.818 | 0.941 | -0.264 |
| 4.102920005588154 | -0.82 | 0.939 | -0.255 |
| 4.106061598241744 | -0.822 | 0.937 | -0.246 |
| 4.109203190895333 | -0.824 | 0.934 | -0.236 |
| 4.112344783548923 | -0.825 | 0.932 | -0.227 |
| 4.115486376202512 | -0.827 | 0.93 | -0.218 |
| 4.118627968856102 | -0.829 | 0.927 | -0.209 |
| 4.121769561509692 | -0.831 | 0.925 | -0.2 |
| 4.124911154163281 | -0.832 | 0.923 | -0.19 |
| 4.128052746816871 | -0.834 | 0.92 | -0.181 |
| 4.13119433947046 | -0.836 | 0.918 | -0.172 |
| 4.13433593212405 | -0.838 | 0.915 | -0.163 |
| 4.13747752477764 | -0.839 | 0.913 | -0.153 |
| 4.14061911743123 | -0.841 | 0.91 | -0.144 |
| 4.143760710084818 | -0.843 | 0.907 | -0.135 |
| 4.146902302738408 | -0.844 | 0.905 | -0.125 |
| 4.150043895391998 | -0.846 | 0.902 | -0.116 |
| 4.153185488045588 | -0.848 | 0.899 | -0.107 |
| 4.156327080699177 | -0.849 | 0.897 | -0.097 |
| 4.159468673352766 | -0.851 | 0.894 | -0.088 |
| 4.162610266006356 | -0.853 | 0.891 | -0.078 |
| 4.165751858659946 | -0.854 | 0.888 | -0.069 |
| 4.168893451313535 | -0.856 | 0.885 | -0.06 |
| 4.172035043967125 | -0.858 | 0.882 | -0.05 |
| 4.175176636620715 | -0.859 | 0.879 | -0.041 |
| 4.178318229274304 | -0.861 | 0.876 | -0.031 |
| 4.181459821927894 | -0.862 | 0.873 | -0.022 |
| 4.184601414581484 | -0.864 | 0.87 | -0.013 |
| 4.187743007235073 | -0.866 | 0.867 | -0.003 |
| 4.190884599888663 | -0.867 | 0.864 | 0.006 |
| 4.194026192542252 | -0.869 | 0.861 | 0.016 |
| 4.197167785195842 | -0.87 | 0.858 | 0.025 |
| 4.200309377849432 | -0.872 | 0.854 | 0.035 |
| 4.203450970503021 | -0.873 | 0.851 | 0.044 |
| 4.206592563156611 | -0.875 | 0.848 | 0.053 |
| 4.2097341558102 | -0.876 | 0.844 | 0.063 |
| 4.21287574846379 | -0.878 | 0.841 | 0.072 |
| 4.21601734111738 | -0.879 | 0.838 | 0.082 |
| 4.21915893377097 | -0.881 | 0.834 | 0.091 |
| 4.222300526424559 | -0.882 | 0.831 | 0.1 |
| 4.225442119078148 | -0.884 | 0.827 | 0.11 |
| 4.228583711731738 | -0.885 | 0.824 | 0.119 |
| 4.231725304385327 | -0.887 | 0.82 | 0.128 |
| 4.234866897038917 | -0.888 | 0.816 | 0.138 |
| 4.238008489692506 | -0.89 | 0.813 | 0.147 |
| 4.241150082346096 | -0.891 | 0.809 | 0.156 |
| 4.244291674999685 | -0.892 | 0.805 | 0.166 |
| 4.247433267653276 | -0.894 | 0.802 | 0.175 |
| 4.250574860306865 | -0.895 | 0.798 | 0.184 |
| 4.253716452960455 | -0.897 | 0.794 | 0.194 |
| 4.256858045614044 | -0.898 | 0.79 | 0.203 |
| 4.259999638267634 | -0.899 | 0.786 | 0.212 |
| 4.263141230921224 | -0.901 | 0.782 | 0.221 |
| 4.266282823574813 | -0.902 | 0.778 | 0.23 |
| 4.269424416228403 | -0.903 | 0.775 | 0.24 |
| 4.272566008881992 | -0.905 | 0.771 | 0.249 |
| 4.275707601535582 | -0.906 | 0.766 | 0.258 |
| 4.27884919418917 | -0.907 | 0.762 | 0.267 |
| 4.28199078684276 | -0.909 | 0.758 | 0.276 |
| 4.285132379496351 | -0.91 | 0.754 | 0.285 |
| 4.28827397214994 | -0.911 | 0.75 | 0.294 |
| 4.29141556480353 | -0.913 | 0.746 | 0.303 |
| 4.294557157457119 | -0.914 | 0.742 | 0.312 |
| 4.29769875011071 | -0.915 | 0.738 | 0.321 |
| 4.300840342764299 | -0.917 | 0.733 | 0.33 |
| 4.303981935417888 | -0.918 | 0.729 | 0.339 |
| 4.307123528071478 | -0.919 | 0.725 | 0.348 |
| 4.310265120725067 | -0.92 | 0.72 | 0.356 |
| 4.313406713378657 | -0.921 | 0.716 | 0.365 |
| 4.316548306032247 | -0.923 | 0.712 | 0.374 |
| 4.319689898685836 | -0.924 | 0.707 | 0.383 |
| 4.322831491339426 | -0.925 | 0.703 | 0.391 |
| 4.325973083993015 | -0.926 | 0.698 | 0.4 |
| 4.329114676646605 | -0.927 | 0.694 | 0.409 |
| 4.332256269300195 | -0.929 | 0.689 | 0.417 |
| 4.335397861953784 | -0.93 | 0.685 | 0.426 |
| 4.338539454607374 | -0.931 | 0.68 | 0.434 |
| 4.341681047260963 | -0.932 | 0.675 | 0.443 |
| 4.344822639914553 | -0.933 | 0.671 | 0.451 |
| 4.347964232568143 | -0.934 | 0.666 | 0.46 |
| 4.351105825221732 | -0.935 | 0.661 | 0.468 |
| 4.354247417875322 | -0.937 | 0.657 | 0.476 |
| 4.357389010528911 | -0.938 | 0.652 | 0.485 |
| 4.360530603182501 | -0.939 | 0.647 | 0.493 |
| 4.36367219583609 | -0.94 | 0.642 | 0.501 |
| 4.36681378848968 | -0.941 | 0.637 | 0.509 |
| 4.36995538114327 | -0.942 | 0.633 | 0.517 |
| 4.373096973796859 | -0.943 | 0.628 | 0.525 |
| 4.376238566450449 | -0.944 | 0.623 | 0.533 |
| 4.379380159104038 | -0.945 | 0.618 | 0.541 |
| 4.382521751757628 | -0.946 | 0.613 | 0.549 |
| 4.385663344411217 | -0.947 | 0.608 | 0.557 |
| 4.388804937064807 | -0.948 | 0.603 | 0.565 |
| 4.391946529718397 | -0.949 | 0.598 | 0.572 |
| 4.395088122371987 | -0.95 | 0.593 | 0.58 |
| 4.398229715025576 | -0.951 | 0.588 | 0.588 |
| 4.401371307679165 | -0.952 | 0.583 | 0.595 |
| 4.404512900332755 | -0.953 | 0.578 | 0.603 |
| 4.407654492986345 | -0.954 | 0.572 | 0.61 |
| 4.410796085639934 | -0.955 | 0.567 | 0.618 |
| 4.413937678293524 | -0.956 | 0.562 | 0.625 |
| 4.417079270947114 | -0.957 | 0.557 | 0.633 |
| 4.420220863600703 | -0.958 | 0.552 | 0.64 |
| 4.423362456254293 | -0.959 | 0.546 | 0.647 |
| 4.426504048907883 | -0.959 | 0.541 | 0.654 |
| 4.429645641561472 | -0.96 | 0.536 | 0.661 |
| 4.432787234215062 | -0.961 | 0.531 | 0.668 |
| 4.435928826868651 | -0.962 | 0.525 | 0.675 |
| 4.43907041952224 | -0.963 | 0.52 | 0.682 |
| 4.44221201217583 | -0.964 | 0.514 | 0.689 |
| 4.44535360482942 | -0.965 | 0.509 | 0.696 |
| 4.44849519748301 | -0.965 | 0.504 | 0.703 |
| 4.4516367901366 | -0.966 | 0.498 | 0.709 |
| 4.454778382790188 | -0.967 | 0.493 | 0.716 |
| 4.457919975443779 | -0.968 | 0.487 | 0.722 |
| 4.461061568097368 | -0.969 | 0.482 | 0.729 |
| 4.464203160750958 | -0.969 | 0.476 | 0.735 |
| 4.467344753404547 | -0.97 | 0.471 | 0.742 |
| 4.470486346058137 | -0.971 | 0.465 | 0.748 |
| 4.473627938711726 | -0.972 | 0.46 | 0.754 |
| 4.476769531365316 | -0.972 | 0.454 | 0.76 |
| 4.479911124018905 | -0.973 | 0.448 | 0.766 |
| 4.483052716672495 | -0.974 | 0.443 | 0.773 |
| 4.486194309326085 | -0.975 | 0.437 | 0.778 |
| 4.489335901979674 | -0.975 | 0.431 | 0.784 |
| 4.492477494633264 | -0.976 | 0.426 | 0.79 |
| 4.495619087286854 | -0.977 | 0.42 | 0.796 |
| 4.498760679940443 | -0.977 | 0.414 | 0.802 |
| 4.501902272594033 | -0.978 | 0.409 | 0.807 |
| 4.505043865247622 | -0.979 | 0.403 | 0.813 |
| 4.508185457901212 | -0.979 | 0.397 | 0.818 |
| 4.511327050554801 | -0.98 | 0.391 | 0.824 |
| 4.514468643208391 | -0.98 | 0.386 | 0.829 |
| 4.517610235861981 | -0.981 | 0.38 | 0.834 |
| 4.520751828515571 | -0.982 | 0.374 | 0.839 |
| 4.52389342116916 | -0.982 | 0.368 | 0.844 |
| 4.52703501382275 | -0.983 | 0.362 | 0.849 |
| 4.530176606476339 | -0.983 | 0.356 | 0.854 |
| 4.533318199129928 | -0.984 | 0.351 | 0.859 |
| 4.536459791783518 | -0.985 | 0.345 | 0.864 |
| 4.539601384437108 | -0.985 | 0.339 | 0.869 |
| 4.542742977090698 | -0.986 | 0.333 | 0.873 |
| 4.545884569744287 | -0.986 | 0.327 | 0.878 |
| 4.549026162397876 | -0.987 | 0.321 | 0.882 |
| 4.552167755051466 | -0.987 | 0.315 | 0.887 |
| 4.555309347705056 | -0.988 | 0.309 | 0.891 |
| 4.558450940358646 | -0.988 | 0.303 | 0.895 |
| 4.561592533012235 | -0.989 | 0.297 | 0.899 |
| 4.564734125665825 | -0.989 | 0.291 | 0.903 |
| 4.567875718319415 | -0.99 | 0.285 | 0.907 |
| 4.571017310973004 | -0.99 | 0.279 | 0.911 |
| 4.574158903626594 | -0.99 | 0.273 | 0.915 |
| 4.577300496280183 | -0.991 | 0.267 | 0.919 |
| 4.580442088933772 | -0.991 | 0.261 | 0.923 |
| 4.583583681587362 | -0.992 | 0.255 | 0.926 |
| 4.586725274240952 | -0.992 | 0.249 | 0.93 |
| 4.589866866894542 | -0.993 | 0.243 | 0.933 |
| 4.593008459548131 | -0.993 | 0.236 | 0.937 |
| 4.596150052201721 | -0.993 | 0.23 | 0.94 |
| 4.59929164485531 | -0.994 | 0.224 | 0.943 |
| 4.6024332375089 | -0.994 | 0.218 | 0.946 |
| 4.60557483016249 | -0.994 | 0.212 | 0.949 |
| 4.608716422816079 | -0.995 | 0.206 | 0.952 |
| 4.611858015469668 | -0.995 | 0.2 | 0.955 |
| 4.614999608123258 | -0.995 | 0.194 | 0.958 |
| 4.618141200776848 | -0.996 | 0.187 | 0.96 |
| 4.621282793430437 | -0.996 | 0.181 | 0.963 |
| 4.624424386084027 | -0.996 | 0.175 | 0.965 |
| 4.627565978737617 | -0.996 | 0.169 | 0.968 |
| 4.630707571391206 | -0.997 | 0.163 | 0.97 |
| 4.633849164044795 | -0.997 | 0.156 | 0.972 |
| 4.636990756698386 | -0.997 | 0.15 | 0.975 |
| 4.640132349351975 | -0.997 | 0.144 | 0.977 |
| 4.643273942005564 | -0.998 | 0.138 | 0.979 |
| 4.646415534659154 | -0.998 | 0.132 | 0.98 |
| 4.649557127312744 | -0.998 | 0.125 | 0.982 |
| 4.652698719966334 | -0.998 | 0.119 | 0.984 |
| 4.655840312619923 | -0.998 | 0.113 | 0.986 |
| 4.658981905273513 | -0.999 | 0.107 | 0.987 |
| 4.662123497927102 | -0.999 | 0.1 | 0.989 |
| 4.665265090580692 | -0.999 | 0.094 | 0.99 |
| 4.668406683234282 | -0.999 | 0.088 | 0.991 |
| 4.671548275887871 | -0.999 | 0.082 | 0.993 |
| 4.674689868541461 | -0.999 | 0.075 | 0.994 |
| 4.67783146119505 | -0.999 | 0.069 | 0.995 |
| 4.68097305384864 | -1 | 0.063 | 0.996 |
| 4.68411464650223 | -1 | 0.057 | 0.996 |
| 4.687256239155819 | -1 | 0.05 | 0.997 |
| 4.690397831809409 | -1 | 0.044 | 0.998 |
| 4.693539424462998 | -1 | 0.038 | 0.998 |
| 4.696681017116588 | -1 | 0.031 | 0.999 |
| 4.699822609770177 | -1 | 0.025 | 0.999 |
| 4.702964202423767 | -1 | 0.019 | 1 |
| 4.706105795077356 | -1 | 0.013 | 1 |
| 4.709247387730946 | -1 | 0.006 | 1 |
| 4.712388980384535 | -1 | 0 | 1 |
| 4.715530573038126 | -1 | -0.006 | 1 |
| 4.718672165691715 | -1 | -0.013 | 1 |
| 4.721813758345305 | -1 | -0.019 | 1 |
| 4.724955350998894 | -1 | -0.025 | 0.999 |
| 4.728096943652484 | -1 | -0.031 | 0.999 |
| 4.731238536306074 | -1 | -0.038 | 0.998 |
| 4.734380128959663 | -1 | -0.044 | 0.998 |
| 4.737521721613253 | -1 | -0.05 | 0.997 |
| 4.740663314266842 | -1 | -0.057 | 0.996 |
| 4.743804906920432 | -1 | -0.063 | 0.996 |
| 4.74694649957402 | -0.999 | -0.069 | 0.995 |
| 4.750088092227611 | -0.999 | -0.075 | 0.994 |
| 4.7532296848812 | -0.999 | -0.082 | 0.993 |
| 4.75637127753479 | -0.999 | -0.088 | 0.991 |
| 4.75951287018838 | -0.999 | -0.094 | 0.99 |
| 4.76265446284197 | -0.999 | -0.1 | 0.989 |
| 4.765796055495559 | -0.999 | -0.107 | 0.987 |
| 4.768937648149149 | -0.998 | -0.113 | 0.986 |
| 4.772079240802738 | -0.998 | -0.119 | 0.984 |
| 4.775220833456327 | -0.998 | -0.125 | 0.982 |
| 4.778362426109917 | -0.998 | -0.132 | 0.98 |
| 4.781504018763507 | -0.998 | -0.138 | 0.979 |
| 4.784645611417097 | -0.997 | -0.144 | 0.977 |
| 4.787787204070686 | -0.997 | -0.15 | 0.975 |
| 4.790928796724275 | -0.997 | -0.156 | 0.972 |
| 4.794070389377865 | -0.997 | -0.163 | 0.97 |
| 4.797211982031455 | -0.996 | -0.169 | 0.968 |
| 4.800353574685045 | -0.996 | -0.175 | 0.965 |
| 4.803495167338634 | -0.996 | -0.181 | 0.963 |
| 4.806636759992224 | -0.996 | -0.187 | 0.96 |
| 4.809778352645814 | -0.995 | -0.194 | 0.958 |
| 4.812919945299403 | -0.995 | -0.2 | 0.955 |
| 4.816061537952993 | -0.995 | -0.206 | 0.952 |
| 4.819203130606582 | -0.994 | -0.212 | 0.949 |
| 4.822344723260172 | -0.994 | -0.218 | 0.946 |
| 4.825486315913761 | -0.994 | -0.224 | 0.943 |
| 4.828627908567351 | -0.993 | -0.23 | 0.94 |
| 4.83176950122094 | -0.993 | -0.236 | 0.937 |
| 4.83491109387453 | -0.993 | -0.243 | 0.933 |
| 4.83805268652812 | -0.992 | -0.249 | 0.93 |
| 4.841194279181709 | -0.992 | -0.255 | 0.926 |
| 4.844335871835299 | -0.991 | -0.261 | 0.923 |
| 4.847477464488889 | -0.991 | -0.267 | 0.919 |
| 4.850619057142478 | -0.99 | -0.273 | 0.915 |
| 4.853760649796068 | -0.99 | -0.279 | 0.911 |
| 4.856902242449657 | -0.99 | -0.285 | 0.907 |
| 4.860043835103247 | -0.989 | -0.291 | 0.903 |
| 4.863185427756837 | -0.989 | -0.297 | 0.899 |
| 4.866327020410426 | -0.988 | -0.303 | 0.895 |
| 4.869468613064015 | -0.988 | -0.309 | 0.891 |
| 4.872610205717605 | -0.987 | -0.315 | 0.887 |
| 4.875751798371195 | -0.987 | -0.321 | 0.882 |
| 4.878893391024784 | -0.986 | -0.327 | 0.878 |
| 4.882034983678374 | -0.986 | -0.333 | 0.873 |
| 4.885176576331964 | -0.985 | -0.339 | 0.869 |
| 4.888318168985553 | -0.985 | -0.345 | 0.864 |
| 4.891459761639143 | -0.984 | -0.351 | 0.859 |
| 4.894601354292733 | -0.983 | -0.356 | 0.854 |
| 4.897742946946322 | -0.983 | -0.362 | 0.849 |
| 4.900884539599912 | -0.982 | -0.368 | 0.844 |
| 4.904026132253501 | -0.982 | -0.374 | 0.839 |
| 4.907167724907091 | -0.981 | -0.38 | 0.834 |
| 4.91030931756068 | -0.98 | -0.386 | 0.829 |
| 4.91345091021427 | -0.98 | -0.391 | 0.824 |
| 4.91659250286786 | -0.979 | -0.397 | 0.818 |
| 4.91973409552145 | -0.979 | -0.403 | 0.813 |
| 4.922875688175039 | -0.978 | -0.409 | 0.807 |
| 4.926017280828628 | -0.977 | -0.414 | 0.802 |
| 4.929158873482218 | -0.977 | -0.42 | 0.796 |
| 4.932300466135808 | -0.976 | -0.426 | 0.79 |
| 4.935442058789397 | -0.975 | -0.431 | 0.784 |
| 4.938583651442987 | -0.975 | -0.437 | 0.778 |
| 4.941725244096576 | -0.974 | -0.443 | 0.773 |
| 4.944866836750166 | -0.973 | -0.448 | 0.766 |
| 4.948008429403755 | -0.972 | -0.454 | 0.76 |
| 4.951150022057345 | -0.972 | -0.46 | 0.754 |
| 4.954291614710935 | -0.971 | -0.465 | 0.748 |
| 4.957433207364524 | -0.97 | -0.471 | 0.742 |
| 4.960574800018114 | -0.969 | -0.476 | 0.735 |
| 4.963716392671704 | -0.969 | -0.482 | 0.729 |
| 4.966857985325293 | -0.968 | -0.487 | 0.722 |
| 4.969999577978883 | -0.967 | -0.493 | 0.716 |
| 4.973141170632472 | -0.966 | -0.498 | 0.709 |
| 4.976282763286062 | -0.965 | -0.504 | 0.703 |
| 4.979424355939651 | -0.965 | -0.509 | 0.696 |
| 4.982565948593241 | -0.964 | -0.514 | 0.689 |
| 4.985707541246831 | -0.963 | -0.52 | 0.682 |
| 4.98884913390042 | -0.962 | -0.525 | 0.675 |
| 4.99199072655401 | -0.961 | -0.531 | 0.668 |
| 4.9951323192076 | -0.96 | -0.536 | 0.661 |
| 4.99827391186119 | -0.959 | -0.541 | 0.654 |
| 5.00141550451478 | -0.959 | -0.546 | 0.647 |
| 5.004557097168369 | -0.958 | -0.552 | 0.64 |
| 5.007698689821958 | -0.957 | -0.557 | 0.633 |
| 5.010840282475548 | -0.956 | -0.562 | 0.625 |
| 5.013981875129137 | -0.955 | -0.567 | 0.618 |
| 5.017123467782727 | -0.954 | -0.572 | 0.61 |
| 5.020265060436317 | -0.953 | -0.578 | 0.603 |
| 5.023406653089906 | -0.952 | -0.583 | 0.595 |
| 5.026548245743496 | -0.951 | -0.588 | 0.588 |
| 5.029689838397085 | -0.95 | -0.593 | 0.58 |
| 5.032831431050674 | -0.949 | -0.598 | 0.572 |
| 5.035973023704264 | -0.948 | -0.603 | 0.565 |
| 5.039114616357854 | -0.947 | -0.608 | 0.557 |
| 5.042256209011444 | -0.946 | -0.613 | 0.549 |
| 5.045397801665033 | -0.945 | -0.618 | 0.541 |
| 5.048539394318622 | -0.944 | -0.623 | 0.533 |
| 5.051680986972213 | -0.943 | -0.628 | 0.525 |
| 5.054822579625802 | -0.942 | -0.633 | 0.517 |
| 5.057964172279392 | -0.941 | -0.637 | 0.509 |
| 5.061105764932981 | -0.94 | -0.642 | 0.501 |
| 5.064247357586571 | -0.939 | -0.647 | 0.493 |
| 5.067388950240161 | -0.938 | -0.652 | 0.485 |
| 5.07053054289375 | -0.937 | -0.657 | 0.476 |
| 5.07367213554734 | -0.935 | -0.661 | 0.468 |
| 5.07681372820093 | -0.934 | -0.666 | 0.46 |
| 5.079955320854519 | -0.933 | -0.671 | 0.451 |
| 5.083096913508108 | -0.932 | -0.675 | 0.443 |
| 5.086238506161698 | -0.931 | -0.68 | 0.434 |
| 5.089380098815288 | -0.93 | -0.685 | 0.426 |
| 5.092521691468877 | -0.929 | -0.689 | 0.417 |
| 5.095663284122466 | -0.927 | -0.694 | 0.409 |
| 5.098804876776057 | -0.926 | -0.698 | 0.4 |
| 5.101946469429646 | -0.925 | -0.703 | 0.391 |
| 5.105088062083236 | -0.924 | -0.707 | 0.383 |
| 5.108229654736825 | -0.923 | -0.712 | 0.374 |
| 5.111371247390415 | -0.921 | -0.716 | 0.365 |
| 5.114512840044005 | -0.92 | -0.72 | 0.356 |
| 5.117654432697594 | -0.919 | -0.725 | 0.348 |
| 5.120796025351184 | -0.918 | -0.729 | 0.339 |
| 5.123937618004773 | -0.917 | -0.733 | 0.33 |
| 5.127079210658363 | -0.915 | -0.738 | 0.321 |
| 5.130220803311953 | -0.914 | -0.742 | 0.312 |
| 5.133362395965542 | -0.913 | -0.746 | 0.303 |
| 5.136503988619131 | -0.911 | -0.75 | 0.294 |
| 5.13964558127272 | -0.91 | -0.754 | 0.285 |
| 5.142787173926311 | -0.909 | -0.758 | 0.276 |
| 5.1459287665799 | -0.907 | -0.762 | 0.267 |
| 5.14907035923349 | -0.906 | -0.766 | 0.258 |
| 5.15221195188708 | -0.905 | -0.771 | 0.249 |
| 5.15535354454067 | -0.903 | -0.775 | 0.24 |
| 5.158495137194259 | -0.902 | -0.778 | 0.23 |
| 5.161636729847848 | -0.901 | -0.782 | 0.221 |
| 5.164778322501438 | -0.899 | -0.786 | 0.212 |
| 5.167919915155028 | -0.898 | -0.79 | 0.203 |
| 5.171061507808617 | -0.897 | -0.794 | 0.194 |
| 5.174203100462206 | -0.895 | -0.798 | 0.184 |
| 5.177344693115796 | -0.894 | -0.802 | 0.175 |
| 5.180486285769386 | -0.892 | -0.805 | 0.166 |
| 5.183627878422976 | -0.891 | -0.809 | 0.156 |
| 5.186769471076565 | -0.89 | -0.813 | 0.147 |
| 5.189911063730155 | -0.888 | -0.816 | 0.138 |
| 5.193052656383744 | -0.887 | -0.82 | 0.128 |
| 5.196194249037334 | -0.885 | -0.824 | 0.119 |
| 5.199335841690924 | -0.884 | -0.827 | 0.11 |
| 5.202477434344513 | -0.882 | -0.831 | 0.1 |
| 5.205619026998103 | -0.881 | -0.834 | 0.091 |
| 5.208760619651692 | -0.879 | -0.838 | 0.082 |
| 5.211902212305282 | -0.878 | -0.841 | 0.072 |
| 5.215043804958871 | -0.876 | -0.844 | 0.063 |
| 5.218185397612461 | -0.875 | -0.848 | 0.053 |
| 5.221326990266051 | -0.873 | -0.851 | 0.044 |
| 5.22446858291964 | -0.872 | -0.854 | 0.035 |
| 5.22761017557323 | -0.87 | -0.858 | 0.025 |
| 5.23075176822682 | -0.869 | -0.861 | 0.016 |
| 5.23389336088041 | -0.867 | -0.864 | 0.006 |
| 5.237034953533999 | -0.866 | -0.867 | -0.003 |
| 5.240176546187588 | -0.864 | -0.87 | -0.013 |
| 5.243318138841178 | -0.862 | -0.873 | -0.022 |
| 5.246459731494767 | -0.861 | -0.876 | -0.031 |
| 5.249601324148357 | -0.859 | -0.879 | -0.041 |
| 5.252742916801947 | -0.858 | -0.882 | -0.05 |
| 5.255884509455536 | -0.856 | -0.885 | -0.06 |
| 5.259026102109125 | -0.854 | -0.888 | -0.069 |
| 5.262167694762715 | -0.853 | -0.891 | -0.078 |
| 5.265309287416305 | -0.851 | -0.894 | -0.088 |
| 5.268450880069895 | -0.849 | -0.897 | -0.097 |
| 5.271592472723484 | -0.848 | -0.899 | -0.107 |
| 5.274734065377074 | -0.846 | -0.902 | -0.116 |
| 5.277875658030664 | -0.844 | -0.905 | -0.125 |
| 5.281017250684253 | -0.843 | -0.907 | -0.135 |
| 5.284158843337843 | -0.841 | -0.91 | -0.144 |
| 5.287300435991432 | -0.839 | -0.913 | -0.153 |
| 5.290442028645022 | -0.838 | -0.915 | -0.163 |
| 5.293583621298612 | -0.836 | -0.918 | -0.172 |
| 5.296725213952201 | -0.834 | -0.92 | -0.181 |
| 5.299866806605791 | -0.832 | -0.923 | -0.19 |
| 5.30300839925938 | -0.831 | -0.925 | -0.2 |
| 5.30614999191297 | -0.829 | -0.927 | -0.209 |
| 5.30929158456656 | -0.827 | -0.93 | -0.218 |
| 5.312433177220149 | -0.825 | -0.932 | -0.227 |
| 5.315574769873739 | -0.824 | -0.934 | -0.236 |
| 5.318716362527328 | -0.822 | -0.937 | -0.246 |
| 5.321857955180918 | -0.82 | -0.939 | -0.255 |
| 5.324999547834508 | -0.818 | -0.941 | -0.264 |
| 5.328141140488097 | -0.816 | -0.943 | -0.273 |
| 5.331282733141686 | -0.815 | -0.945 | -0.282 |
| 5.334424325795276 | -0.813 | -0.947 | -0.291 |
| 5.337565918448866 | -0.811 | -0.949 | -0.3 |
| 5.340707511102456 | -0.809 | -0.951 | -0.309 |
| 5.343849103756045 | -0.807 | -0.953 | -0.318 |
| 5.346990696409634 | -0.805 | -0.955 | -0.327 |
| 5.350132289063224 | -0.803 | -0.957 | -0.336 |
| 5.353273881716814 | -0.802 | -0.959 | -0.345 |
| 5.356415474370403 | -0.8 | -0.96 | -0.353 |
| 5.359557067023993 | -0.798 | -0.962 | -0.362 |
| 5.362698659677583 | -0.796 | -0.964 | -0.371 |
| 5.365840252331172 | -0.794 | -0.965 | -0.38 |
| 5.368981844984762 | -0.792 | -0.967 | -0.388 |
| 5.372123437638351 | -0.79 | -0.969 | -0.397 |
| 5.375265030291941 | -0.788 | -0.97 | -0.406 |
| 5.378406622945531 | -0.786 | -0.972 | -0.414 |
| 5.38154821559912 | -0.784 | -0.973 | -0.423 |
| 5.38468980825271 | -0.782 | -0.975 | -0.431 |
| 5.387831400906299 | -0.78 | -0.976 | -0.44 |
| 5.39097299355989 | -0.778 | -0.977 | -0.448 |
| 5.394114586213479 | -0.776 | -0.979 | -0.457 |
| 5.397256178867068 | -0.775 | -0.98 | -0.465 |
| 5.400397771520657 | -0.773 | -0.981 | -0.473 |
| 5.403539364174247 | -0.771 | -0.982 | -0.482 |
| 5.406680956827837 | -0.769 | -0.983 | -0.49 |
| 5.409822549481426 | -0.766 | -0.985 | -0.498 |
| 5.412964142135016 | -0.764 | -0.986 | -0.506 |
| 5.416105734788605 | -0.762 | -0.987 | -0.514 |
| 5.419247327442195 | -0.76 | -0.988 | -0.522 |
| 5.422388920095785 | -0.758 | -0.989 | -0.531 |
| 5.425530512749375 | -0.756 | -0.99 | -0.538 |
| 5.428672105402964 | -0.754 | -0.99 | -0.546 |
| 5.431813698056554 | -0.752 | -0.991 | -0.554 |
| 5.434955290710143 | -0.75 | -0.992 | -0.562 |
| 5.438096883363733 | -0.748 | -0.993 | -0.57 |
| 5.441238476017322 | -0.746 | -0.994 | -0.578 |
| 5.444380068670912 | -0.744 | -0.994 | -0.585 |
| 5.447521661324502 | -0.742 | -0.995 | -0.593 |
| 5.450663253978091 | -0.74 | -0.996 | -0.6 |
| 5.453804846631681 | -0.738 | -0.996 | -0.608 |
| 5.456946439285271 | -0.735 | -0.997 | -0.615 |
| 5.46008803193886 | -0.733 | -0.997 | -0.623 |
| 5.46322962459245 | -0.731 | -0.998 | -0.63 |
| 5.466371217246039 | -0.729 | -0.998 | -0.637 |
| 5.46951280989963 | -0.727 | -0.998 | -0.645 |
| 5.472654402553218 | -0.725 | -0.999 | -0.652 |
| 5.475795995206808 | -0.722 | -0.999 | -0.659 |
| 5.478937587860398 | -0.72 | -0.999 | -0.666 |
| 5.482079180513987 | -0.718 | -1 | -0.673 |
| 5.485220773167577 | -0.716 | -1 | -0.68 |
| 5.488362365821166 | -0.714 | -1 | -0.687 |
| 5.491503958474756 | -0.712 | -1 | -0.694 |
| 5.494645551128346 | -0.709 | -1 | -0.7 |
| 5.497787143781935 | -0.707 | -1 | -0.707 |
| 5.500928736435525 | -0.705 | -1 | -0.714 |
| 5.504070329089115 | -0.703 | -1 | -0.72 |
| 5.507211921742704 | -0.7 | -1 | -0.727 |
| 5.510353514396294 | -0.698 | -1 | -0.733 |
| 5.513495107049883 | -0.696 | -1 | -0.74 |
| 5.516636699703473 | -0.694 | -0.999 | -0.746 |
| 5.519778292357062 | -0.691 | -0.999 | -0.752 |
| 5.522919885010652 | -0.689 | -0.999 | -0.758 |
| 5.526061477664242 | -0.687 | -0.998 | -0.764 |
| 5.529203070317831 | -0.685 | -0.998 | -0.771 |
| 5.532344662971421 | -0.682 | -0.998 | -0.776 |
| 5.535486255625011 | -0.68 | -0.997 | -0.782 |
| 5.5386278482786 | -0.678 | -0.997 | -0.788 |
| 5.54176944093219 | -0.675 | -0.996 | -0.794 |
| 5.544911033585779 | -0.673 | -0.996 | -0.8 |
| 5.54805262623937 | -0.671 | -0.995 | -0.805 |
| 5.551194218892959 | -0.668 | -0.994 | -0.811 |
| 5.554335811546548 | -0.666 | -0.994 | -0.816 |
| 5.557477404200137 | -0.664 | -0.993 | -0.822 |
| 5.560618996853727 | -0.661 | -0.992 | -0.827 |
| 5.563760589507317 | -0.659 | -0.991 | -0.832 |
| 5.566902182160906 | -0.657 | -0.99 | -0.838 |
| 5.570043774814496 | -0.654 | -0.99 | -0.843 |
| 5.573185367468086 | -0.652 | -0.989 | -0.848 |
| 5.576326960121675 | -0.649 | -0.988 | -0.853 |
| 5.579468552775264 | -0.647 | -0.987 | -0.858 |
| 5.582610145428854 | -0.645 | -0.986 | -0.862 |
| 5.585751738082444 | -0.642 | -0.985 | -0.867 |
| 5.588893330736034 | -0.64 | -0.983 | -0.872 |
| 5.592034923389623 | -0.637 | -0.982 | -0.876 |
| 5.595176516043213 | -0.635 | -0.981 | -0.881 |
| 5.598318108696803 | -0.633 | -0.98 | -0.885 |
| 5.601459701350392 | -0.63 | -0.979 | -0.89 |
| 5.604601294003982 | -0.628 | -0.977 | -0.894 |
| 5.607742886657571 | -0.625 | -0.976 | -0.898 |
| 5.610884479311161 | -0.623 | -0.975 | -0.902 |
| 5.61402607196475 | -0.62 | -0.973 | -0.906 |
| 5.61716766461834 | -0.618 | -0.972 | -0.91 |
| 5.62030925727193 | -0.615 | -0.97 | -0.914 |
| 5.623450849925519 | -0.613 | -0.969 | -0.918 |
| 5.626592442579109 | -0.61 | -0.967 | -0.921 |
| 5.629734035232698 | -0.608 | -0.965 | -0.925 |
| 5.632875627886288 | -0.605 | -0.964 | -0.929 |
| 5.636017220539878 | -0.603 | -0.962 | -0.932 |
| 5.639158813193467 | -0.6 | -0.96 | -0.935 |
| 5.642300405847057 | -0.598 | -0.959 | -0.939 |
| 5.645441998500646 | -0.595 | -0.957 | -0.942 |
| 5.648583591154236 | -0.593 | -0.955 | -0.945 |
| 5.651725183807825 | -0.59 | -0.953 | -0.948 |
| 5.654866776461415 | -0.588 | -0.951 | -0.951 |
| 5.658008369115005 | -0.585 | -0.949 | -0.954 |
| 5.661149961768594 | -0.583 | -0.947 | -0.957 |
| 5.664291554422184 | -0.58 | -0.945 | -0.959 |
| 5.667433147075774 | -0.578 | -0.943 | -0.962 |
| 5.670574739729363 | -0.575 | -0.941 | -0.965 |
| 5.673716332382953 | -0.572 | -0.939 | -0.967 |
| 5.676857925036542 | -0.57 | -0.937 | -0.969 |
| 5.679999517690132 | -0.567 | -0.934 | -0.972 |
| 5.683141110343721 | -0.565 | -0.932 | -0.974 |
| 5.686282702997311 | -0.562 | -0.93 | -0.976 |
| 5.689424295650901 | -0.559 | -0.927 | -0.978 |
| 5.69256588830449 | -0.557 | -0.925 | -0.98 |
| 5.69570748095808 | -0.554 | -0.923 | -0.982 |
| 5.69884907361167 | -0.552 | -0.92 | -0.983 |
| 5.701990666265259 | -0.549 | -0.918 | -0.985 |
| 5.705132258918849 | -0.546 | -0.915 | -0.987 |
| 5.708273851572438 | -0.544 | -0.913 | -0.988 |
| 5.711415444226028 | -0.541 | -0.91 | -0.99 |
| 5.714557036879618 | -0.538 | -0.907 | -0.991 |
| 5.717698629533207 | -0.536 | -0.905 | -0.992 |
| 5.720840222186797 | -0.533 | -0.902 | -0.993 |
| 5.723981814840386 | -0.531 | -0.899 | -0.994 |
| 5.727123407493976 | -0.528 | -0.897 | -0.995 |
| 5.730265000147565 | -0.525 | -0.894 | -0.996 |
| 5.733406592801155 | -0.522 | -0.891 | -0.997 |
| 5.736548185454744 | -0.52 | -0.888 | -0.998 |
| 5.739689778108334 | -0.517 | -0.885 | -0.998 |
| 5.742831370761924 | -0.514 | -0.882 | -0.999 |
| 5.745972963415514 | -0.512 | -0.879 | -0.999 |
| 5.749114556069103 | -0.509 | -0.876 | -1 |
| 5.752256148722693 | -0.506 | -0.873 | -1 |
| 5.755397741376282 | -0.504 | -0.87 | -1 |
| 5.758539334029872 | -0.501 | -0.867 | -1 |
| 5.761680926683462 | -0.498 | -0.864 | -1 |
| 5.764822519337051 | -0.495 | -0.861 | -1 |
| 5.767964111990641 | -0.493 | -0.858 | -1 |
| 5.77110570464423 | -0.49 | -0.854 | -0.999 |
| 5.77424729729782 | -0.487 | -0.851 | -0.999 |
| 5.77738888995141 | -0.485 | -0.848 | -0.999 |
| 5.780530482605 | -0.482 | -0.844 | -0.998 |
| 5.783672075258588 | -0.479 | -0.841 | -0.997 |
| 5.786813667912178 | -0.476 | -0.838 | -0.997 |
| 5.789955260565768 | -0.473 | -0.834 | -0.996 |
| 5.793096853219358 | -0.471 | -0.831 | -0.995 |
| 5.796238445872947 | -0.468 | -0.827 | -0.994 |
| 5.799380038526537 | -0.465 | -0.824 | -0.993 |
| 5.802521631180126 | -0.462 | -0.82 | -0.992 |
| 5.805663223833715 | -0.46 | -0.816 | -0.99 |
| 5.808804816487306 | -0.457 | -0.813 | -0.989 |
| 5.811946409140895 | -0.454 | -0.809 | -0.988 |
| 5.815088001794485 | -0.451 | -0.805 | -0.986 |
| 5.818229594448074 | -0.448 | -0.802 | -0.985 |
| 5.821371187101663 | -0.446 | -0.798 | -0.983 |
| 5.824512779755254 | -0.443 | -0.794 | -0.981 |
| 5.827654372408843 | -0.44 | -0.79 | -0.979 |
| 5.830795965062433 | -0.437 | -0.786 | -0.977 |
| 5.833937557716022 | -0.434 | -0.782 | -0.975 |
| 5.837079150369612 | -0.431 | -0.778 | -0.973 |
| 5.840220743023201 | -0.429 | -0.775 | -0.971 |
| 5.843362335676791 | -0.426 | -0.771 | -0.969 |
| 5.846503928330381 | -0.423 | -0.766 | -0.966 |
| 5.84964552098397 | -0.42 | -0.762 | -0.964 |
| 5.85278711363756 | -0.417 | -0.758 | -0.961 |
| 5.85592870629115 | -0.414 | -0.754 | -0.959 |
| 5.85907029894474 | -0.412 | -0.75 | -0.956 |
| 5.862211891598329 | -0.409 | -0.746 | -0.953 |
| 5.865353484251918 | -0.406 | -0.742 | -0.95 |
| 5.868495076905508 | -0.403 | -0.738 | -0.947 |
| 5.871636669559098 | -0.4 | -0.733 | -0.944 |
| 5.874778262212687 | -0.397 | -0.729 | -0.941 |
| 5.877919854866277 | -0.394 | -0.725 | -0.938 |
| 5.881061447519866 | -0.391 | -0.72 | -0.934 |
| 5.884203040173456 | -0.388 | -0.716 | -0.931 |
| 5.887344632827046 | -0.386 | -0.712 | -0.927 |
| 5.890486225480635 | -0.383 | -0.707 | -0.924 |
| 5.893627818134224 | -0.38 | -0.703 | -0.92 |
| 5.896769410787814 | -0.377 | -0.698 | -0.917 |
| 5.899911003441404 | -0.374 | -0.694 | -0.913 |
| 5.903052596094994 | -0.371 | -0.689 | -0.909 |
| 5.906194188748583 | -0.368 | -0.685 | -0.905 |
| 5.909335781402172 | -0.365 | -0.68 | -0.901 |
| 5.912477374055762 | -0.362 | -0.675 | -0.897 |
| 5.915618966709352 | -0.359 | -0.671 | -0.892 |
| 5.918760559362942 | -0.356 | -0.666 | -0.888 |
| 5.921902152016531 | -0.353 | -0.661 | -0.884 |
| 5.92504374467012 | -0.351 | -0.657 | -0.879 |
| 5.92818533732371 | -0.348 | -0.652 | -0.875 |
| 5.9313269299773 | -0.345 | -0.647 | -0.87 |
| 5.93446852263089 | -0.342 | -0.642 | -0.866 |
| 5.93761011528448 | -0.339 | -0.637 | -0.861 |
| 5.940751707938068 | -0.336 | -0.633 | -0.856 |
| 5.943893300591658 | -0.333 | -0.628 | -0.851 |
| 5.947034893245248 | -0.33 | -0.623 | -0.846 |
| 5.950176485898837 | -0.327 | -0.618 | -0.841 |
| 5.953318078552427 | -0.324 | -0.613 | -0.836 |
| 5.956459671206017 | -0.321 | -0.608 | -0.831 |
| 5.959601263859606 | -0.318 | -0.603 | -0.825 |
| 5.962742856513196 | -0.315 | -0.598 | -0.82 |
| 5.965884449166785 | -0.312 | -0.593 | -0.815 |
| 5.969026041820375 | -0.309 | -0.588 | -0.809 |
| 5.972167634473964 | -0.306 | -0.583 | -0.803 |
| 5.975309227127554 | -0.303 | -0.578 | -0.798 |
| 5.978450819781144 | -0.3 | -0.572 | -0.792 |
| 5.981592412434733 | -0.297 | -0.567 | -0.786 |
| 5.984734005088323 | -0.294 | -0.562 | -0.78 |
| 5.987875597741913 | -0.291 | -0.557 | -0.775 |
| 5.991017190395502 | -0.288 | -0.552 | -0.769 |
| 5.994158783049092 | -0.285 | -0.546 | -0.762 |
| 5.997300375702681 | -0.282 | -0.541 | -0.756 |
| 6.000441968356271 | -0.279 | -0.536 | -0.75 |
| 6.003583561009861 | -0.276 | -0.531 | -0.744 |
| 6.00672515366345 | -0.273 | -0.525 | -0.738 |
| 6.00986674631704 | -0.27 | -0.52 | -0.731 |
| 6.01300833897063 | -0.267 | -0.514 | -0.725 |
| 6.01614993162422 | -0.264 | -0.509 | -0.718 |
| 6.019291524277808 | -0.261 | -0.504 | -0.712 |
| 6.022433116931398 | -0.258 | -0.498 | -0.705 |
| 6.025574709584988 | -0.255 | -0.493 | -0.698 |
| 6.028716302238577 | -0.252 | -0.487 | -0.691 |
| 6.031857894892167 | -0.249 | -0.482 | -0.685 |
| 6.034999487545757 | -0.246 | -0.476 | -0.678 |
| 6.038141080199346 | -0.243 | -0.471 | -0.671 |
| 6.041282672852935 | -0.24 | -0.465 | -0.664 |
| 6.044424265506525 | -0.236 | -0.46 | -0.657 |
| 6.047565858160115 | -0.233 | -0.454 | -0.649 |
| 6.050707450813704 | -0.23 | -0.448 | -0.642 |
| 6.053849043467294 | -0.227 | -0.443 | -0.635 |
| 6.056990636120884 | -0.224 | -0.437 | -0.628 |
| 6.060132228774473 | -0.221 | -0.431 | -0.62 |
| 6.063273821428063 | -0.218 | -0.426 | -0.613 |
| 6.066415414081653 | -0.215 | -0.42 | -0.605 |
| 6.069557006735242 | -0.212 | -0.414 | -0.598 |
| 6.072698599388831 | -0.209 | -0.409 | -0.59 |
| 6.07584019204242 | -0.206 | -0.403 | -0.583 |
| 6.078981784696011 | -0.203 | -0.397 | -0.575 |
| 6.082123377349601 | -0.2 | -0.391 | -0.567 |
| 6.08526497000319 | -0.197 | -0.386 | -0.559 |
| 6.08840656265678 | -0.194 | -0.38 | -0.552 |
| 6.09154815531037 | -0.19 | -0.374 | -0.544 |
| 6.094689747963959 | -0.187 | -0.368 | -0.536 |
| 6.097831340617549 | -0.184 | -0.362 | -0.528 |
| 6.100972933271138 | -0.181 | -0.356 | -0.52 |
| 6.104114525924728 | -0.178 | -0.351 | -0.512 |
| 6.107256118578317 | -0.175 | -0.345 | -0.504 |
| 6.110397711231907 | -0.172 | -0.339 | -0.495 |
| 6.113539303885497 | -0.169 | -0.333 | -0.487 |
| 6.116680896539086 | -0.166 | -0.327 | -0.479 |
| 6.119822489192675 | -0.163 | -0.321 | -0.471 |
| 6.122964081846265 | -0.16 | -0.315 | -0.462 |
| 6.126105674499855 | -0.156 | -0.309 | -0.454 |
| 6.129247267153445 | -0.153 | -0.303 | -0.446 |
| 6.132388859807034 | -0.15 | -0.297 | -0.437 |
| 6.135530452460624 | -0.147 | -0.291 | -0.429 |
| 6.138672045114213 | -0.144 | -0.285 | -0.42 |
| 6.141813637767803 | -0.141 | -0.279 | -0.412 |
| 6.144955230421393 | -0.138 | -0.273 | -0.403 |
| 6.148096823074982 | -0.135 | -0.267 | -0.394 |
| 6.151238415728571 | -0.132 | -0.261 | -0.386 |
| 6.154380008382161 | -0.128 | -0.255 | -0.377 |
| 6.157521601035751 | -0.125 | -0.249 | -0.368 |
| 6.16066319368934 | -0.122 | -0.243 | -0.359 |
| 6.16380478634293 | -0.119 | -0.236 | -0.351 |
| 6.16694637899652 | -0.116 | -0.23 | -0.342 |
| 6.170087971650109 | -0.113 | -0.224 | -0.333 |
| 6.173229564303698 | -0.11 | -0.218 | -0.324 |
| 6.176371156957289 | -0.107 | -0.212 | -0.315 |
| 6.179512749610878 | -0.103 | -0.206 | -0.306 |
| 6.182654342264468 | -0.1 | -0.2 | -0.297 |
| 6.185795934918057 | -0.097 | -0.194 | -0.288 |
| 6.188937527571647 | -0.094 | -0.187 | -0.279 |
| 6.192079120225237 | -0.091 | -0.181 | -0.27 |
| 6.195220712878826 | -0.088 | -0.175 | -0.261 |
| 6.198362305532415 | -0.085 | -0.169 | -0.252 |
| 6.201503898186005 | -0.082 | -0.163 | -0.243 |
| 6.204645490839594 | -0.078 | -0.156 | -0.233 |
| 6.207787083493184 | -0.075 | -0.15 | -0.224 |
| 6.210928676146774 | -0.072 | -0.144 | -0.215 |
| 6.214070268800364 | -0.069 | -0.138 | -0.206 |
| 6.217211861453953 | -0.066 | -0.132 | -0.197 |
| 6.220353454107543 | -0.063 | -0.125 | -0.187 |
| 6.223495046761133 | -0.06 | -0.119 | -0.178 |
| 6.226636639414722 | -0.057 | -0.113 | -0.169 |
| 6.229778232068312 | -0.053 | -0.107 | -0.16 |
| 6.232919824721901 | -0.05 | -0.1 | -0.15 |
| 6.236061417375491 | -0.047 | -0.094 | -0.141 |
| 6.23920301002908 | -0.044 | -0.088 | -0.132 |
| 6.24234460268267 | -0.041 | -0.082 | -0.122 |
| 6.24548619533626 | -0.038 | -0.075 | -0.113 |
| 6.24862778798985 | -0.035 | -0.069 | -0.103 |
| 6.251769380643438 | -0.031 | -0.063 | -0.094 |
| 6.254910973297028 | -0.028 | -0.057 | -0.085 |
| 6.258052565950618 | -0.025 | -0.05 | -0.075 |
| 6.261194158604208 | -0.022 | -0.044 | -0.066 |
| 6.264335751257797 | -0.019 | -0.038 | -0.057 |
| 6.267477343911387 | -0.016 | -0.031 | -0.047 |
| 6.270618936564976 | -0.013 | -0.025 | -0.038 |
| 6.273760529218566 | -0.009 | -0.019 | -0.028 |
| 6.276902121872155 | -0.006 | -0.013 | -0.019 |
| 6.280043714525745 | -0.003 | -0.006 | -0.009 |
| 6.283185307179335 | 0 | 0 | 0 |